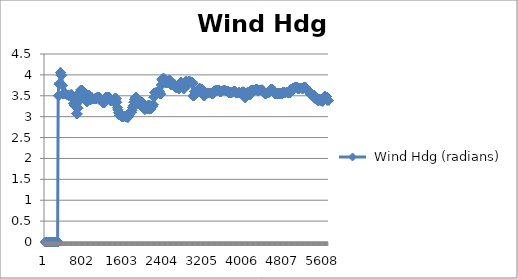
| Category |  Wind Hdg (radians) |
|---|---|
| 0 | 0 |
| 1 | 0 |
| 2 | 0 |
| 3 | 0 |
| 4 | 0 |
| 5 | 0 |
| 6 | 0 |
| 7 | 0 |
| 8 | 0 |
| 9 | 0 |
| 10 | 0 |
| 11 | 0 |
| 12 | 0 |
| 13 | 0 |
| 14 | 0 |
| 15 | 0 |
| 16 | 0 |
| 17 | 0 |
| 18 | 0 |
| 19 | 0 |
| 20 | 0 |
| 21 | 0 |
| 22 | 0 |
| 23 | 0 |
| 24 | 0 |
| 25 | 0 |
| 26 | 0 |
| 27 | 0 |
| 28 | 0 |
| 29 | 0 |
| 30 | 0 |
| 31 | 0 |
| 32 | 0 |
| 33 | 0 |
| 34 | 0 |
| 35 | 0 |
| 36 | 0 |
| 37 | 0 |
| 38 | 0 |
| 39 | 0 |
| 40 | 0 |
| 41 | 0 |
| 42 | 0 |
| 43 | 0 |
| 44 | 0 |
| 45 | 0 |
| 46 | 0 |
| 47 | 0 |
| 48 | 0 |
| 49 | 0 |
| 50 | 0 |
| 51 | 0 |
| 52 | 0 |
| 53 | 0 |
| 54 | 0 |
| 55 | 0 |
| 56 | 0 |
| 57 | 0 |
| 58 | 0 |
| 59 | 0 |
| 60 | 0 |
| 61 | 0 |
| 62 | 0 |
| 63 | 0 |
| 64 | 0 |
| 65 | 0 |
| 66 | 0 |
| 67 | 0 |
| 68 | 0 |
| 69 | 0 |
| 70 | 0 |
| 71 | 0 |
| 72 | 0 |
| 73 | 0 |
| 74 | 0 |
| 75 | 0 |
| 76 | 0 |
| 77 | 0 |
| 78 | 0 |
| 79 | 0 |
| 80 | 0 |
| 81 | 0 |
| 82 | 0 |
| 83 | 0 |
| 84 | 0 |
| 85 | 0 |
| 86 | 0 |
| 87 | 0 |
| 88 | 0 |
| 89 | 0 |
| 90 | 0 |
| 91 | 0 |
| 92 | 0 |
| 93 | 0 |
| 94 | 0 |
| 95 | 0 |
| 96 | 0 |
| 97 | 0 |
| 98 | 0 |
| 99 | 0 |
| 100 | 0 |
| 101 | 0 |
| 102 | 0 |
| 103 | 0 |
| 104 | 0 |
| 105 | 0 |
| 106 | 0 |
| 107 | 0 |
| 108 | 0 |
| 109 | 0 |
| 110 | 0 |
| 111 | 0 |
| 112 | 0 |
| 113 | 0 |
| 114 | 0 |
| 115 | 0 |
| 116 | 0 |
| 117 | 0 |
| 118 | 0 |
| 119 | 0 |
| 120 | 0 |
| 121 | 0 |
| 122 | 0 |
| 123 | 0 |
| 124 | 0 |
| 125 | 0 |
| 126 | 0 |
| 127 | 0 |
| 128 | 0 |
| 129 | 0 |
| 130 | 0 |
| 131 | 0 |
| 132 | 0 |
| 133 | 0 |
| 134 | 0 |
| 135 | 0 |
| 136 | 0 |
| 137 | 0 |
| 138 | 0 |
| 139 | 0 |
| 140 | 0 |
| 141 | 0 |
| 142 | 0 |
| 143 | 0 |
| 144 | 0 |
| 145 | 0 |
| 146 | 0 |
| 147 | 0 |
| 148 | 0 |
| 149 | 0 |
| 150 | 0 |
| 151 | 0 |
| 152 | 0 |
| 153 | 0 |
| 154 | 0 |
| 155 | 0 |
| 156 | 0 |
| 157 | 0 |
| 158 | 0 |
| 159 | 0 |
| 160 | 0 |
| 161 | 0 |
| 162 | 0 |
| 163 | 0 |
| 164 | 0 |
| 165 | 0 |
| 166 | 0 |
| 167 | 0 |
| 168 | 0 |
| 169 | 0 |
| 170 | 0 |
| 171 | 0 |
| 172 | 0 |
| 173 | 0 |
| 174 | 0 |
| 175 | 0 |
| 176 | 0 |
| 177 | 0 |
| 178 | 0 |
| 179 | 0 |
| 180 | 0 |
| 181 | 0 |
| 182 | 0 |
| 183 | 0 |
| 184 | 0 |
| 185 | 0 |
| 186 | 0 |
| 187 | 0 |
| 188 | 0 |
| 189 | 0 |
| 190 | 0 |
| 191 | 0 |
| 192 | 0 |
| 193 | 0 |
| 194 | 0 |
| 195 | 0 |
| 196 | 0 |
| 197 | 0 |
| 198 | 0 |
| 199 | 0 |
| 200 | 0 |
| 201 | 0 |
| 202 | 0 |
| 203 | 0 |
| 204 | 0 |
| 205 | 0 |
| 206 | 0 |
| 207 | 0 |
| 208 | 0 |
| 209 | 0 |
| 210 | 0 |
| 211 | 0 |
| 212 | 0 |
| 213 | 0 |
| 214 | 0 |
| 215 | 0 |
| 216 | 0 |
| 217 | 0 |
| 218 | 0 |
| 219 | 0 |
| 220 | 0 |
| 221 | 0 |
| 222 | 0 |
| 223 | 0 |
| 224 | 0 |
| 225 | 0 |
| 226 | 0 |
| 227 | 0 |
| 228 | 0 |
| 229 | 0 |
| 230 | 0 |
| 231 | 0 |
| 232 | 0 |
| 233 | 0 |
| 234 | 0 |
| 235 | 0 |
| 236 | 0 |
| 237 | 0 |
| 238 | 0 |
| 239 | 0 |
| 240 | 0 |
| 241 | 0 |
| 242 | 0 |
| 243 | 0 |
| 244 | 0 |
| 245 | 0 |
| 246 | 0 |
| 247 | 0 |
| 248 | 0 |
| 249 | 0 |
| 250 | 0 |
| 251 | 0 |
| 252 | 0 |
| 253 | 0 |
| 254 | 0 |
| 255 | 0 |
| 256 | 0 |
| 257 | 0 |
| 258 | 0 |
| 259 | 0 |
| 260 | 0 |
| 261 | 0 |
| 262 | 0 |
| 263 | 3.498 |
| 264 | 3.498 |
| 265 | 3.498 |
| 266 | 3.498 |
| 267 | 3.498 |
| 268 | 3.498 |
| 269 | 3.498 |
| 270 | 3.498 |
| 271 | 3.498 |
| 272 | 3.498 |
| 273 | 3.498 |
| 274 | 3.498 |
| 275 | 3.498 |
| 276 | 3.498 |
| 277 | 3.498 |
| 278 | 3.778 |
| 279 | 3.778 |
| 280 | 3.778 |
| 281 | 3.778 |
| 282 | 3.778 |
| 283 | 3.778 |
| 284 | 3.778 |
| 285 | 3.778 |
| 286 | 3.778 |
| 287 | 3.778 |
| 288 | 3.778 |
| 289 | 3.778 |
| 290 | 3.808 |
| 291 | 3.808 |
| 292 | 3.808 |
| 293 | 3.808 |
| 294 | 3.808 |
| 295 | 3.808 |
| 296 | 3.808 |
| 297 | 3.808 |
| 298 | 3.808 |
| 299 | 3.808 |
| 300 | 3.808 |
| 301 | 3.808 |
| 302 | 4.059 |
| 303 | 4.059 |
| 304 | 4.059 |
| 305 | 4.059 |
| 306 | 4.059 |
| 307 | 4.059 |
| 308 | 4.059 |
| 309 | 4.059 |
| 310 | 4.059 |
| 311 | 4.059 |
| 312 | 4.059 |
| 313 | 4.059 |
| 314 | 4.059 |
| 315 | 4.059 |
| 316 | 3.992 |
| 317 | 3.992 |
| 318 | 3.992 |
| 319 | 3.992 |
| 320 | 3.992 |
| 321 | 3.992 |
| 322 | 3.992 |
| 323 | 3.992 |
| 324 | 3.992 |
| 325 | 3.992 |
| 326 | 3.992 |
| 327 | 3.992 |
| 328 | 3.992 |
| 329 | 3.988 |
| 330 | 3.988 |
| 331 | 3.988 |
| 332 | 3.988 |
| 333 | 3.988 |
| 334 | 3.988 |
| 335 | 3.988 |
| 336 | 3.988 |
| 337 | 3.988 |
| 338 | 3.988 |
| 339 | 3.988 |
| 340 | 3.988 |
| 341 | 3.988 |
| 342 | 3.988 |
| 343 | 3.754 |
| 344 | 3.754 |
| 345 | 3.754 |
| 346 | 3.754 |
| 347 | 3.754 |
| 348 | 3.754 |
| 349 | 3.754 |
| 350 | 3.754 |
| 351 | 3.754 |
| 352 | 3.754 |
| 353 | 3.754 |
| 354 | 3.754 |
| 355 | 3.754 |
| 356 | 3.533 |
| 357 | 3.533 |
| 358 | 3.533 |
| 359 | 3.533 |
| 360 | 3.533 |
| 361 | 3.533 |
| 362 | 3.533 |
| 363 | 3.533 |
| 364 | 3.533 |
| 365 | 3.533 |
| 366 | 3.533 |
| 367 | 3.533 |
| 368 | 3.533 |
| 369 | 3.551 |
| 370 | 3.551 |
| 371 | 3.551 |
| 372 | 3.551 |
| 373 | 3.551 |
| 374 | 3.551 |
| 375 | 3.551 |
| 376 | 3.551 |
| 377 | 3.551 |
| 378 | 3.551 |
| 379 | 3.551 |
| 380 | 3.551 |
| 381 | 3.551 |
| 382 | 3.551 |
| 383 | 3.551 |
| 384 | 3.551 |
| 385 | 3.574 |
| 386 | 3.574 |
| 387 | 3.574 |
| 388 | 3.574 |
| 389 | 3.574 |
| 390 | 3.574 |
| 391 | 3.574 |
| 392 | 3.574 |
| 393 | 3.574 |
| 394 | 3.574 |
| 395 | 3.574 |
| 396 | 3.574 |
| 397 | 3.569 |
| 398 | 3.569 |
| 399 | 3.569 |
| 400 | 3.569 |
| 401 | 3.569 |
| 402 | 3.569 |
| 403 | 3.569 |
| 404 | 3.569 |
| 405 | 3.569 |
| 406 | 3.569 |
| 407 | 3.569 |
| 408 | 3.569 |
| 409 | 3.569 |
| 410 | 3.569 |
| 411 | 3.54 |
| 412 | 3.54 |
| 413 | 3.54 |
| 414 | 3.54 |
| 415 | 3.54 |
| 416 | 3.54 |
| 417 | 3.54 |
| 418 | 3.54 |
| 419 | 3.54 |
| 420 | 3.54 |
| 421 | 3.54 |
| 422 | 3.54 |
| 423 | 3.54 |
| 424 | 3.53 |
| 425 | 3.53 |
| 426 | 3.53 |
| 427 | 3.53 |
| 428 | 3.53 |
| 429 | 3.53 |
| 430 | 3.53 |
| 431 | 3.53 |
| 432 | 3.53 |
| 433 | 3.53 |
| 434 | 3.53 |
| 435 | 3.53 |
| 436 | 3.53 |
| 437 | 3.53 |
| 438 | 3.53 |
| 439 | 3.526 |
| 440 | 3.526 |
| 441 | 3.526 |
| 442 | 3.526 |
| 443 | 3.526 |
| 444 | 3.526 |
| 445 | 3.526 |
| 446 | 3.526 |
| 447 | 3.526 |
| 448 | 3.526 |
| 449 | 3.526 |
| 450 | 3.526 |
| 451 | 3.526 |
| 452 | 3.526 |
| 453 | 3.517 |
| 454 | 3.517 |
| 455 | 3.517 |
| 456 | 3.517 |
| 457 | 3.517 |
| 458 | 3.517 |
| 459 | 3.517 |
| 460 | 3.517 |
| 461 | 3.517 |
| 462 | 3.517 |
| 463 | 3.517 |
| 464 | 3.517 |
| 465 | 3.517 |
| 466 | 3.509 |
| 467 | 3.509 |
| 468 | 3.509 |
| 469 | 3.509 |
| 470 | 3.509 |
| 471 | 3.509 |
| 472 | 3.509 |
| 473 | 3.509 |
| 474 | 3.509 |
| 475 | 3.509 |
| 476 | 3.509 |
| 477 | 3.509 |
| 478 | 3.509 |
| 479 | 3.509 |
| 480 | 3.49 |
| 481 | 3.49 |
| 482 | 3.49 |
| 483 | 3.49 |
| 484 | 3.49 |
| 485 | 3.49 |
| 486 | 3.49 |
| 487 | 3.49 |
| 488 | 3.49 |
| 489 | 3.49 |
| 490 | 3.49 |
| 491 | 3.49 |
| 492 | 3.49 |
| 493 | 3.498 |
| 494 | 3.498 |
| 495 | 3.498 |
| 496 | 3.498 |
| 497 | 3.498 |
| 498 | 3.498 |
| 499 | 3.498 |
| 500 | 3.498 |
| 501 | 3.498 |
| 502 | 3.498 |
| 503 | 3.498 |
| 504 | 3.498 |
| 505 | 3.518 |
| 506 | 3.518 |
| 507 | 3.518 |
| 508 | 3.518 |
| 509 | 3.518 |
| 510 | 3.518 |
| 511 | 3.518 |
| 512 | 3.518 |
| 513 | 3.518 |
| 514 | 3.518 |
| 515 | 3.518 |
| 516 | 3.518 |
| 517 | 3.518 |
| 518 | 3.518 |
| 519 | 3.518 |
| 520 | 3.518 |
| 521 | 3.533 |
| 522 | 3.533 |
| 523 | 3.533 |
| 524 | 3.533 |
| 525 | 3.533 |
| 526 | 3.533 |
| 527 | 3.533 |
| 528 | 3.533 |
| 529 | 3.533 |
| 530 | 3.533 |
| 531 | 3.533 |
| 532 | 3.533 |
| 533 | 3.533 |
| 534 | 3.521 |
| 535 | 3.521 |
| 536 | 3.521 |
| 537 | 3.521 |
| 538 | 3.521 |
| 539 | 3.521 |
| 540 | 3.521 |
| 541 | 3.521 |
| 542 | 3.521 |
| 543 | 3.521 |
| 544 | 3.521 |
| 545 | 3.521 |
| 546 | 3.521 |
| 547 | 3.453 |
| 548 | 3.453 |
| 549 | 3.453 |
| 550 | 3.453 |
| 551 | 3.453 |
| 552 | 3.453 |
| 553 | 3.453 |
| 554 | 3.453 |
| 555 | 3.453 |
| 556 | 3.453 |
| 557 | 3.453 |
| 558 | 3.453 |
| 559 | 3.453 |
| 560 | 3.315 |
| 561 | 3.315 |
| 562 | 3.315 |
| 563 | 3.315 |
| 564 | 3.315 |
| 565 | 3.315 |
| 566 | 3.315 |
| 567 | 3.315 |
| 568 | 3.315 |
| 569 | 3.315 |
| 570 | 3.315 |
| 571 | 3.315 |
| 572 | 3.315 |
| 573 | 3.315 |
| 574 | 3.279 |
| 575 | 3.279 |
| 576 | 3.279 |
| 577 | 3.279 |
| 578 | 3.279 |
| 579 | 3.279 |
| 580 | 3.279 |
| 581 | 3.279 |
| 582 | 3.279 |
| 583 | 3.279 |
| 584 | 3.279 |
| 585 | 3.279 |
| 586 | 3.299 |
| 587 | 3.299 |
| 588 | 3.299 |
| 589 | 3.299 |
| 590 | 3.299 |
| 591 | 3.299 |
| 592 | 3.299 |
| 593 | 3.299 |
| 594 | 3.299 |
| 595 | 3.299 |
| 596 | 3.299 |
| 597 | 3.299 |
| 598 | 3.299 |
| 599 | 3.299 |
| 600 | 3.324 |
| 601 | 3.324 |
| 602 | 3.324 |
| 603 | 3.324 |
| 604 | 3.324 |
| 605 | 3.324 |
| 606 | 3.324 |
| 607 | 3.324 |
| 608 | 3.324 |
| 609 | 3.324 |
| 610 | 3.324 |
| 611 | 3.324 |
| 612 | 3.324 |
| 613 | 3.291 |
| 614 | 3.291 |
| 615 | 3.291 |
| 616 | 3.291 |
| 617 | 3.291 |
| 618 | 3.291 |
| 619 | 3.291 |
| 620 | 3.291 |
| 621 | 3.291 |
| 622 | 3.291 |
| 623 | 3.291 |
| 624 | 3.291 |
| 625 | 3.291 |
| 626 | 3.069 |
| 627 | 3.069 |
| 628 | 3.069 |
| 629 | 3.069 |
| 630 | 3.069 |
| 631 | 3.069 |
| 632 | 3.069 |
| 633 | 3.069 |
| 634 | 3.069 |
| 635 | 3.069 |
| 636 | 3.069 |
| 637 | 3.069 |
| 638 | 3.069 |
| 639 | 3.069 |
| 640 | 3.069 |
| 641 | 3.064 |
| 642 | 3.064 |
| 643 | 3.064 |
| 644 | 3.064 |
| 645 | 3.064 |
| 646 | 3.064 |
| 647 | 3.064 |
| 648 | 3.064 |
| 649 | 3.064 |
| 650 | 3.064 |
| 651 | 3.064 |
| 652 | 3.064 |
| 653 | 3.064 |
| 654 | 3.205 |
| 655 | 3.205 |
| 656 | 3.205 |
| 657 | 3.205 |
| 658 | 3.205 |
| 659 | 3.205 |
| 660 | 3.205 |
| 661 | 3.205 |
| 662 | 3.205 |
| 663 | 3.205 |
| 664 | 3.205 |
| 665 | 3.205 |
| 666 | 3.366 |
| 667 | 3.366 |
| 668 | 3.366 |
| 669 | 3.366 |
| 670 | 3.366 |
| 671 | 3.366 |
| 672 | 3.366 |
| 673 | 3.366 |
| 674 | 3.366 |
| 675 | 3.366 |
| 676 | 3.366 |
| 677 | 3.366 |
| 678 | 3.366 |
| 679 | 3.366 |
| 680 | 3.366 |
| 681 | 3.494 |
| 682 | 3.494 |
| 683 | 3.494 |
| 684 | 3.494 |
| 685 | 3.494 |
| 686 | 3.494 |
| 687 | 3.494 |
| 688 | 3.494 |
| 689 | 3.494 |
| 690 | 3.494 |
| 691 | 3.494 |
| 692 | 3.494 |
| 693 | 3.494 |
| 694 | 3.584 |
| 695 | 3.584 |
| 696 | 3.584 |
| 697 | 3.584 |
| 698 | 3.584 |
| 699 | 3.584 |
| 700 | 3.584 |
| 701 | 3.584 |
| 702 | 3.584 |
| 703 | 3.584 |
| 704 | 3.584 |
| 705 | 3.584 |
| 706 | 3.584 |
| 707 | 3.639 |
| 708 | 3.639 |
| 709 | 3.639 |
| 710 | 3.639 |
| 711 | 3.639 |
| 712 | 3.639 |
| 713 | 3.639 |
| 714 | 3.639 |
| 715 | 3.639 |
| 716 | 3.639 |
| 717 | 3.639 |
| 718 | 3.639 |
| 719 | 3.639 |
| 720 | 3.639 |
| 721 | 3.634 |
| 722 | 3.634 |
| 723 | 3.634 |
| 724 | 3.634 |
| 725 | 3.634 |
| 726 | 3.634 |
| 727 | 3.634 |
| 728 | 3.634 |
| 729 | 3.634 |
| 730 | 3.634 |
| 731 | 3.634 |
| 732 | 3.634 |
| 733 | 3.632 |
| 734 | 3.632 |
| 735 | 3.632 |
| 736 | 3.632 |
| 737 | 3.632 |
| 738 | 3.632 |
| 739 | 3.632 |
| 740 | 3.632 |
| 741 | 3.632 |
| 742 | 3.632 |
| 743 | 3.632 |
| 744 | 3.632 |
| 745 | 3.632 |
| 746 | 3.632 |
| 747 | 3.632 |
| 748 | 3.62 |
| 749 | 3.62 |
| 750 | 3.62 |
| 751 | 3.62 |
| 752 | 3.62 |
| 753 | 3.62 |
| 754 | 3.62 |
| 755 | 3.62 |
| 756 | 3.62 |
| 757 | 3.62 |
| 758 | 3.62 |
| 759 | 3.62 |
| 760 | 3.62 |
| 761 | 3.62 |
| 762 | 3.62 |
| 763 | 3.596 |
| 764 | 3.596 |
| 765 | 3.596 |
| 766 | 3.596 |
| 767 | 3.596 |
| 768 | 3.596 |
| 769 | 3.596 |
| 770 | 3.596 |
| 771 | 3.596 |
| 772 | 3.596 |
| 773 | 3.596 |
| 774 | 3.596 |
| 775 | 3.596 |
| 776 | 3.552 |
| 777 | 3.552 |
| 778 | 3.552 |
| 779 | 3.552 |
| 780 | 3.552 |
| 781 | 3.552 |
| 782 | 3.552 |
| 783 | 3.552 |
| 784 | 3.552 |
| 785 | 3.552 |
| 786 | 3.552 |
| 787 | 3.552 |
| 788 | 3.552 |
| 789 | 3.552 |
| 790 | 3.552 |
| 791 | 3.552 |
| 792 | 3.516 |
| 793 | 3.516 |
| 794 | 3.516 |
| 795 | 3.516 |
| 796 | 3.516 |
| 797 | 3.516 |
| 798 | 3.516 |
| 799 | 3.516 |
| 800 | 3.516 |
| 801 | 3.516 |
| 802 | 3.516 |
| 803 | 3.516 |
| 804 | 3.516 |
| 805 | 3.474 |
| 806 | 3.474 |
| 807 | 3.474 |
| 808 | 3.474 |
| 809 | 3.474 |
| 810 | 3.474 |
| 811 | 3.474 |
| 812 | 3.474 |
| 813 | 3.474 |
| 814 | 3.474 |
| 815 | 3.474 |
| 816 | 3.474 |
| 817 | 3.37 |
| 818 | 3.37 |
| 819 | 3.37 |
| 820 | 3.37 |
| 821 | 3.37 |
| 822 | 3.37 |
| 823 | 3.37 |
| 824 | 3.37 |
| 825 | 3.37 |
| 826 | 3.37 |
| 827 | 3.37 |
| 828 | 3.37 |
| 829 | 3.37 |
| 830 | 3.37 |
| 831 | 3.37 |
| 832 | 3.349 |
| 833 | 3.349 |
| 834 | 3.349 |
| 835 | 3.349 |
| 836 | 3.349 |
| 837 | 3.349 |
| 838 | 3.349 |
| 839 | 3.349 |
| 840 | 3.349 |
| 841 | 3.349 |
| 842 | 3.349 |
| 843 | 3.349 |
| 844 | 3.349 |
| 845 | 3.391 |
| 846 | 3.391 |
| 847 | 3.391 |
| 848 | 3.391 |
| 849 | 3.391 |
| 850 | 3.391 |
| 851 | 3.391 |
| 852 | 3.391 |
| 853 | 3.391 |
| 854 | 3.391 |
| 855 | 3.391 |
| 856 | 3.468 |
| 857 | 3.468 |
| 858 | 3.468 |
| 859 | 3.468 |
| 860 | 3.468 |
| 861 | 3.468 |
| 862 | 3.468 |
| 863 | 3.468 |
| 864 | 3.468 |
| 865 | 3.468 |
| 866 | 3.468 |
| 867 | 3.468 |
| 868 | 3.468 |
| 869 | 3.468 |
| 870 | 3.468 |
| 871 | 3.468 |
| 872 | 3.514 |
| 873 | 3.514 |
| 874 | 3.514 |
| 875 | 3.514 |
| 876 | 3.514 |
| 877 | 3.514 |
| 878 | 3.514 |
| 879 | 3.514 |
| 880 | 3.514 |
| 881 | 3.514 |
| 882 | 3.514 |
| 883 | 3.434 |
| 884 | 3.434 |
| 885 | 3.434 |
| 886 | 3.434 |
| 887 | 3.434 |
| 888 | 3.434 |
| 889 | 3.434 |
| 890 | 3.434 |
| 891 | 3.434 |
| 892 | 3.434 |
| 893 | 3.434 |
| 894 | 3.434 |
| 895 | 3.434 |
| 896 | 3.434 |
| 897 | 3.391 |
| 898 | 3.391 |
| 899 | 3.391 |
| 900 | 3.391 |
| 901 | 3.391 |
| 902 | 3.391 |
| 903 | 3.391 |
| 904 | 3.391 |
| 905 | 3.391 |
| 906 | 3.391 |
| 907 | 3.391 |
| 908 | 3.391 |
| 909 | 3.459 |
| 910 | 3.459 |
| 911 | 3.459 |
| 912 | 3.459 |
| 913 | 3.459 |
| 914 | 3.459 |
| 915 | 3.459 |
| 916 | 3.459 |
| 917 | 3.459 |
| 918 | 3.459 |
| 919 | 3.459 |
| 920 | 3.459 |
| 921 | 3.459 |
| 922 | 3.459 |
| 923 | 3.463 |
| 924 | 3.463 |
| 925 | 3.463 |
| 926 | 3.463 |
| 927 | 3.463 |
| 928 | 3.463 |
| 929 | 3.463 |
| 930 | 3.463 |
| 931 | 3.463 |
| 932 | 3.463 |
| 933 | 3.463 |
| 934 | 3.463 |
| 935 | 3.463 |
| 936 | 3.463 |
| 937 | 3.463 |
| 938 | 3.452 |
| 939 | 3.452 |
| 940 | 3.452 |
| 941 | 3.452 |
| 942 | 3.452 |
| 943 | 3.452 |
| 944 | 3.452 |
| 945 | 3.452 |
| 946 | 3.452 |
| 947 | 3.452 |
| 948 | 3.452 |
| 949 | 3.452 |
| 950 | 3.425 |
| 951 | 3.425 |
| 952 | 3.425 |
| 953 | 3.425 |
| 954 | 3.425 |
| 955 | 3.425 |
| 956 | 3.425 |
| 957 | 3.425 |
| 958 | 3.425 |
| 959 | 3.425 |
| 960 | 3.425 |
| 961 | 3.425 |
| 962 | 3.425 |
| 963 | 3.425 |
| 964 | 3.411 |
| 965 | 3.411 |
| 966 | 3.411 |
| 967 | 3.411 |
| 968 | 3.411 |
| 969 | 3.411 |
| 970 | 3.411 |
| 971 | 3.411 |
| 972 | 3.411 |
| 973 | 3.411 |
| 974 | 3.411 |
| 975 | 3.411 |
| 976 | 3.411 |
| 977 | 3.411 |
| 978 | 3.413 |
| 979 | 3.413 |
| 980 | 3.413 |
| 981 | 3.413 |
| 982 | 3.413 |
| 983 | 3.413 |
| 984 | 3.413 |
| 985 | 3.413 |
| 986 | 3.413 |
| 987 | 3.413 |
| 988 | 3.413 |
| 989 | 3.413 |
| 990 | 3.422 |
| 991 | 3.422 |
| 992 | 3.422 |
| 993 | 3.422 |
| 994 | 3.422 |
| 995 | 3.422 |
| 996 | 3.422 |
| 997 | 3.422 |
| 998 | 3.422 |
| 999 | 3.422 |
| 1000 | 3.422 |
| 1001 | 3.422 |
| 1002 | 3.422 |
| 1003 | 3.422 |
| 1004 | 3.443 |
| 1005 | 3.443 |
| 1006 | 3.443 |
| 1007 | 3.443 |
| 1008 | 3.443 |
| 1009 | 3.443 |
| 1010 | 3.443 |
| 1011 | 3.443 |
| 1012 | 3.443 |
| 1013 | 3.443 |
| 1014 | 3.443 |
| 1015 | 3.443 |
| 1016 | 3.431 |
| 1017 | 3.431 |
| 1018 | 3.431 |
| 1019 | 3.431 |
| 1020 | 3.431 |
| 1021 | 3.431 |
| 1022 | 3.431 |
| 1023 | 3.431 |
| 1024 | 3.431 |
| 1025 | 3.431 |
| 1026 | 3.431 |
| 1027 | 3.431 |
| 1028 | 3.431 |
| 1029 | 3.431 |
| 1030 | 3.431 |
| 1031 | 3.431 |
| 1032 | 3.456 |
| 1033 | 3.456 |
| 1034 | 3.456 |
| 1035 | 3.456 |
| 1036 | 3.456 |
| 1037 | 3.456 |
| 1038 | 3.456 |
| 1039 | 3.456 |
| 1040 | 3.456 |
| 1041 | 3.456 |
| 1042 | 3.456 |
| 1043 | 3.456 |
| 1044 | 3.472 |
| 1045 | 3.472 |
| 1046 | 3.472 |
| 1047 | 3.472 |
| 1048 | 3.472 |
| 1049 | 3.472 |
| 1050 | 3.472 |
| 1051 | 3.472 |
| 1052 | 3.472 |
| 1053 | 3.472 |
| 1054 | 3.472 |
| 1055 | 3.472 |
| 1056 | 3.472 |
| 1057 | 3.472 |
| 1058 | 3.475 |
| 1059 | 3.475 |
| 1060 | 3.475 |
| 1061 | 3.475 |
| 1062 | 3.475 |
| 1063 | 3.475 |
| 1064 | 3.475 |
| 1065 | 3.475 |
| 1066 | 3.475 |
| 1067 | 3.475 |
| 1068 | 3.475 |
| 1069 | 3.475 |
| 1070 | 3.475 |
| 1071 | 3.475 |
| 1072 | 3.475 |
| 1073 | 3.463 |
| 1074 | 3.463 |
| 1075 | 3.463 |
| 1076 | 3.463 |
| 1077 | 3.463 |
| 1078 | 3.463 |
| 1079 | 3.463 |
| 1080 | 3.463 |
| 1081 | 3.463 |
| 1082 | 3.463 |
| 1083 | 3.463 |
| 1084 | 3.463 |
| 1085 | 3.463 |
| 1086 | 3.403 |
| 1087 | 3.403 |
| 1088 | 3.403 |
| 1089 | 3.403 |
| 1090 | 3.403 |
| 1091 | 3.403 |
| 1092 | 3.403 |
| 1093 | 3.403 |
| 1094 | 3.403 |
| 1095 | 3.403 |
| 1096 | 3.403 |
| 1097 | 3.403 |
| 1098 | 3.403 |
| 1099 | 3.437 |
| 1100 | 3.437 |
| 1101 | 3.437 |
| 1102 | 3.437 |
| 1103 | 3.437 |
| 1104 | 3.437 |
| 1105 | 3.437 |
| 1106 | 3.437 |
| 1107 | 3.437 |
| 1108 | 3.437 |
| 1109 | 3.437 |
| 1110 | 3.437 |
| 1111 | 3.437 |
| 1112 | 3.437 |
| 1113 | 3.406 |
| 1114 | 3.406 |
| 1115 | 3.406 |
| 1116 | 3.406 |
| 1117 | 3.406 |
| 1118 | 3.406 |
| 1119 | 3.406 |
| 1120 | 3.406 |
| 1121 | 3.406 |
| 1122 | 3.406 |
| 1123 | 3.406 |
| 1124 | 3.406 |
| 1125 | 3.39 |
| 1126 | 3.39 |
| 1127 | 3.39 |
| 1128 | 3.39 |
| 1129 | 3.39 |
| 1130 | 3.39 |
| 1131 | 3.39 |
| 1132 | 3.39 |
| 1133 | 3.39 |
| 1134 | 3.39 |
| 1135 | 3.39 |
| 1136 | 3.39 |
| 1137 | 3.39 |
| 1138 | 3.39 |
| 1139 | 3.39 |
| 1140 | 3.39 |
| 1141 | 3.345 |
| 1142 | 3.345 |
| 1143 | 3.345 |
| 1144 | 3.345 |
| 1145 | 3.345 |
| 1146 | 3.345 |
| 1147 | 3.345 |
| 1148 | 3.345 |
| 1149 | 3.345 |
| 1150 | 3.345 |
| 1151 | 3.345 |
| 1152 | 3.345 |
| 1153 | 3.345 |
| 1154 | 3.323 |
| 1155 | 3.323 |
| 1156 | 3.323 |
| 1157 | 3.323 |
| 1158 | 3.323 |
| 1159 | 3.323 |
| 1160 | 3.323 |
| 1161 | 3.323 |
| 1162 | 3.323 |
| 1163 | 3.323 |
| 1164 | 3.323 |
| 1165 | 3.323 |
| 1166 | 3.323 |
| 1167 | 3.323 |
| 1168 | 3.323 |
| 1169 | 3.327 |
| 1170 | 3.327 |
| 1171 | 3.327 |
| 1172 | 3.327 |
| 1173 | 3.327 |
| 1174 | 3.327 |
| 1175 | 3.327 |
| 1176 | 3.327 |
| 1177 | 3.327 |
| 1178 | 3.327 |
| 1179 | 3.327 |
| 1180 | 3.327 |
| 1181 | 3.33 |
| 1182 | 3.33 |
| 1183 | 3.33 |
| 1184 | 3.33 |
| 1185 | 3.33 |
| 1186 | 3.33 |
| 1187 | 3.33 |
| 1188 | 3.33 |
| 1189 | 3.33 |
| 1190 | 3.33 |
| 1191 | 3.33 |
| 1192 | 3.33 |
| 1193 | 3.33 |
| 1194 | 3.35 |
| 1195 | 3.35 |
| 1196 | 3.35 |
| 1197 | 3.35 |
| 1198 | 3.35 |
| 1199 | 3.35 |
| 1200 | 3.35 |
| 1201 | 3.35 |
| 1202 | 3.35 |
| 1203 | 3.35 |
| 1204 | 3.35 |
| 1205 | 3.35 |
| 1206 | 3.35 |
| 1207 | 3.35 |
| 1208 | 3.435 |
| 1209 | 3.435 |
| 1210 | 3.435 |
| 1211 | 3.435 |
| 1212 | 3.435 |
| 1213 | 3.435 |
| 1214 | 3.435 |
| 1215 | 3.435 |
| 1216 | 3.435 |
| 1217 | 3.435 |
| 1218 | 3.435 |
| 1219 | 3.435 |
| 1220 | 3.435 |
| 1221 | 3.435 |
| 1222 | 3.476 |
| 1223 | 3.476 |
| 1224 | 3.476 |
| 1225 | 3.476 |
| 1226 | 3.476 |
| 1227 | 3.476 |
| 1228 | 3.476 |
| 1229 | 3.476 |
| 1230 | 3.476 |
| 1231 | 3.476 |
| 1232 | 3.476 |
| 1233 | 3.476 |
| 1234 | 3.476 |
| 1235 | 3.476 |
| 1236 | 3.481 |
| 1237 | 3.481 |
| 1238 | 3.481 |
| 1239 | 3.481 |
| 1240 | 3.481 |
| 1241 | 3.481 |
| 1242 | 3.481 |
| 1243 | 3.481 |
| 1244 | 3.481 |
| 1245 | 3.481 |
| 1246 | 3.481 |
| 1247 | 3.481 |
| 1248 | 3.481 |
| 1249 | 3.481 |
| 1250 | 3.479 |
| 1251 | 3.479 |
| 1252 | 3.479 |
| 1253 | 3.479 |
| 1254 | 3.479 |
| 1255 | 3.479 |
| 1256 | 3.479 |
| 1257 | 3.479 |
| 1258 | 3.479 |
| 1259 | 3.479 |
| 1260 | 3.479 |
| 1261 | 3.479 |
| 1262 | 3.479 |
| 1263 | 3.479 |
| 1264 | 3.479 |
| 1265 | 3.467 |
| 1266 | 3.467 |
| 1267 | 3.467 |
| 1268 | 3.467 |
| 1269 | 3.467 |
| 1270 | 3.467 |
| 1271 | 3.467 |
| 1272 | 3.467 |
| 1273 | 3.467 |
| 1274 | 3.467 |
| 1275 | 3.467 |
| 1276 | 3.467 |
| 1277 | 3.466 |
| 1278 | 3.466 |
| 1279 | 3.466 |
| 1280 | 3.466 |
| 1281 | 3.466 |
| 1282 | 3.466 |
| 1283 | 3.466 |
| 1284 | 3.466 |
| 1285 | 3.466 |
| 1286 | 3.466 |
| 1287 | 3.466 |
| 1288 | 3.466 |
| 1289 | 3.466 |
| 1290 | 3.466 |
| 1291 | 3.401 |
| 1292 | 3.401 |
| 1293 | 3.401 |
| 1294 | 3.401 |
| 1295 | 3.401 |
| 1296 | 3.401 |
| 1297 | 3.401 |
| 1298 | 3.401 |
| 1299 | 3.401 |
| 1300 | 3.401 |
| 1301 | 3.401 |
| 1302 | 3.401 |
| 1303 | 3.401 |
| 1304 | 3.401 |
| 1305 | 3.375 |
| 1306 | 3.375 |
| 1307 | 3.375 |
| 1308 | 3.375 |
| 1309 | 3.375 |
| 1310 | 3.375 |
| 1311 | 3.375 |
| 1312 | 3.375 |
| 1313 | 3.375 |
| 1314 | 3.375 |
| 1315 | 3.375 |
| 1316 | 3.375 |
| 1317 | 3.38 |
| 1318 | 3.38 |
| 1319 | 3.38 |
| 1320 | 3.38 |
| 1321 | 3.38 |
| 1322 | 3.38 |
| 1323 | 3.38 |
| 1324 | 3.38 |
| 1325 | 3.38 |
| 1326 | 3.38 |
| 1327 | 3.38 |
| 1328 | 3.38 |
| 1329 | 3.38 |
| 1330 | 3.38 |
| 1331 | 3.391 |
| 1332 | 3.391 |
| 1333 | 3.391 |
| 1334 | 3.391 |
| 1335 | 3.391 |
| 1336 | 3.391 |
| 1337 | 3.391 |
| 1338 | 3.391 |
| 1339 | 3.391 |
| 1340 | 3.391 |
| 1341 | 3.391 |
| 1342 | 3.391 |
| 1343 | 3.391 |
| 1344 | 3.391 |
| 1345 | 3.389 |
| 1346 | 3.389 |
| 1347 | 3.389 |
| 1348 | 3.389 |
| 1349 | 3.389 |
| 1350 | 3.389 |
| 1351 | 3.389 |
| 1352 | 3.389 |
| 1353 | 3.389 |
| 1354 | 3.389 |
| 1355 | 3.389 |
| 1356 | 3.389 |
| 1357 | 3.379 |
| 1358 | 3.379 |
| 1359 | 3.379 |
| 1360 | 3.379 |
| 1361 | 3.379 |
| 1362 | 3.379 |
| 1363 | 3.379 |
| 1364 | 3.379 |
| 1365 | 3.379 |
| 1366 | 3.379 |
| 1367 | 3.379 |
| 1368 | 3.379 |
| 1369 | 3.379 |
| 1370 | 3.379 |
| 1371 | 3.37 |
| 1372 | 3.37 |
| 1373 | 3.37 |
| 1374 | 3.37 |
| 1375 | 3.37 |
| 1376 | 3.37 |
| 1377 | 3.37 |
| 1378 | 3.37 |
| 1379 | 3.37 |
| 1380 | 3.37 |
| 1381 | 3.37 |
| 1382 | 3.37 |
| 1383 | 3.37 |
| 1384 | 3.37 |
| 1385 | 3.397 |
| 1386 | 3.397 |
| 1387 | 3.397 |
| 1388 | 3.397 |
| 1389 | 3.397 |
| 1390 | 3.397 |
| 1391 | 3.397 |
| 1392 | 3.397 |
| 1393 | 3.397 |
| 1394 | 3.397 |
| 1395 | 3.397 |
| 1396 | 3.397 |
| 1397 | 3.397 |
| 1398 | 3.397 |
| 1399 | 3.397 |
| 1400 | 3.397 |
| 1401 | 3.451 |
| 1402 | 3.451 |
| 1403 | 3.451 |
| 1404 | 3.451 |
| 1405 | 3.451 |
| 1406 | 3.451 |
| 1407 | 3.451 |
| 1408 | 3.451 |
| 1409 | 3.451 |
| 1410 | 3.451 |
| 1411 | 3.451 |
| 1412 | 3.451 |
| 1413 | 3.451 |
| 1414 | 3.43 |
| 1415 | 3.43 |
| 1416 | 3.43 |
| 1417 | 3.43 |
| 1418 | 3.43 |
| 1419 | 3.43 |
| 1420 | 3.43 |
| 1421 | 3.43 |
| 1422 | 3.43 |
| 1423 | 3.43 |
| 1424 | 3.43 |
| 1425 | 3.43 |
| 1426 | 3.43 |
| 1427 | 3.43 |
| 1428 | 3.43 |
| 1429 | 3.346 |
| 1430 | 3.346 |
| 1431 | 3.346 |
| 1432 | 3.346 |
| 1433 | 3.346 |
| 1434 | 3.346 |
| 1435 | 3.346 |
| 1436 | 3.346 |
| 1437 | 3.346 |
| 1438 | 3.346 |
| 1439 | 3.346 |
| 1440 | 3.218 |
| 1441 | 3.218 |
| 1442 | 3.218 |
| 1443 | 3.218 |
| 1444 | 3.218 |
| 1445 | 3.218 |
| 1446 | 3.218 |
| 1447 | 3.218 |
| 1448 | 3.218 |
| 1449 | 3.218 |
| 1450 | 3.218 |
| 1451 | 3.218 |
| 1452 | 3.164 |
| 1453 | 3.164 |
| 1454 | 3.164 |
| 1455 | 3.164 |
| 1456 | 3.164 |
| 1457 | 3.164 |
| 1458 | 3.164 |
| 1459 | 3.164 |
| 1460 | 3.164 |
| 1461 | 3.164 |
| 1462 | 3.164 |
| 1463 | 3.164 |
| 1464 | 3.164 |
| 1465 | 3.164 |
| 1466 | 3.091 |
| 1467 | 3.091 |
| 1468 | 3.091 |
| 1469 | 3.091 |
| 1470 | 3.091 |
| 1471 | 3.091 |
| 1472 | 3.091 |
| 1473 | 3.091 |
| 1474 | 3.091 |
| 1475 | 3.091 |
| 1476 | 3.091 |
| 1477 | 3.091 |
| 1478 | 3.091 |
| 1479 | 3.091 |
| 1480 | 3.091 |
| 1481 | 3.091 |
| 1482 | 3.031 |
| 1483 | 3.031 |
| 1484 | 3.031 |
| 1485 | 3.031 |
| 1486 | 3.031 |
| 1487 | 3.031 |
| 1488 | 3.031 |
| 1489 | 3.031 |
| 1490 | 3.031 |
| 1491 | 3.031 |
| 1492 | 3.031 |
| 1493 | 3.031 |
| 1494 | 3.031 |
| 1495 | 3.043 |
| 1496 | 3.043 |
| 1497 | 3.043 |
| 1498 | 3.043 |
| 1499 | 3.043 |
| 1500 | 3.043 |
| 1501 | 3.043 |
| 1502 | 3.043 |
| 1503 | 3.043 |
| 1504 | 3.043 |
| 1505 | 3.043 |
| 1506 | 3.043 |
| 1507 | 3.053 |
| 1508 | 3.053 |
| 1509 | 3.053 |
| 1510 | 3.053 |
| 1511 | 3.053 |
| 1512 | 3.053 |
| 1513 | 3.053 |
| 1514 | 3.053 |
| 1515 | 3.053 |
| 1516 | 3.053 |
| 1517 | 3.053 |
| 1518 | 3.053 |
| 1519 | 3.053 |
| 1520 | 3.02 |
| 1521 | 3.02 |
| 1522 | 3.02 |
| 1523 | 3.02 |
| 1524 | 3.02 |
| 1525 | 3.02 |
| 1526 | 3.02 |
| 1527 | 3.02 |
| 1528 | 3.02 |
| 1529 | 3.02 |
| 1530 | 3.02 |
| 1531 | 3.02 |
| 1532 | 3.02 |
| 1533 | 2.992 |
| 1534 | 2.992 |
| 1535 | 2.992 |
| 1536 | 2.992 |
| 1537 | 2.992 |
| 1538 | 2.992 |
| 1539 | 2.992 |
| 1540 | 2.992 |
| 1541 | 2.992 |
| 1542 | 2.992 |
| 1543 | 2.992 |
| 1544 | 2.992 |
| 1545 | 2.992 |
| 1546 | 2.992 |
| 1547 | 2.995 |
| 1548 | 2.995 |
| 1549 | 2.995 |
| 1550 | 2.995 |
| 1551 | 2.995 |
| 1552 | 2.995 |
| 1553 | 2.995 |
| 1554 | 2.995 |
| 1555 | 2.995 |
| 1556 | 2.995 |
| 1557 | 2.995 |
| 1558 | 2.995 |
| 1559 | 2.995 |
| 1560 | 2.995 |
| 1561 | 2.995 |
| 1562 | 2.995 |
| 1563 | 2.995 |
| 1564 | 2.995 |
| 1565 | 2.995 |
| 1566 | 2.995 |
| 1567 | 2.995 |
| 1568 | 2.995 |
| 1569 | 2.995 |
| 1570 | 2.995 |
| 1571 | 2.995 |
| 1572 | 2.995 |
| 1573 | 2.995 |
| 1574 | 2.995 |
| 1575 | 2.995 |
| 1576 | 2.995 |
| 1577 | 3.007 |
| 1578 | 3.007 |
| 1579 | 3.007 |
| 1580 | 3.007 |
| 1581 | 3.007 |
| 1582 | 3.007 |
| 1583 | 3.007 |
| 1584 | 3.007 |
| 1585 | 3.007 |
| 1586 | 3.007 |
| 1587 | 3.007 |
| 1588 | 3.007 |
| 1589 | 3.007 |
| 1590 | 3.007 |
| 1591 | 3.007 |
| 1592 | 3.023 |
| 1593 | 3.023 |
| 1594 | 3.023 |
| 1595 | 3.023 |
| 1596 | 3.023 |
| 1597 | 3.023 |
| 1598 | 3.023 |
| 1599 | 3.023 |
| 1600 | 3.023 |
| 1601 | 3.023 |
| 1602 | 3.023 |
| 1603 | 3.023 |
| 1604 | 3.018 |
| 1605 | 3.018 |
| 1606 | 3.018 |
| 1607 | 3.018 |
| 1608 | 3.018 |
| 1609 | 3.018 |
| 1610 | 3.018 |
| 1611 | 3.018 |
| 1612 | 3.018 |
| 1613 | 3.018 |
| 1614 | 3.018 |
| 1615 | 3.018 |
| 1616 | 3.018 |
| 1617 | 3.018 |
| 1618 | 2.989 |
| 1619 | 2.989 |
| 1620 | 2.989 |
| 1621 | 2.989 |
| 1622 | 2.989 |
| 1623 | 2.989 |
| 1624 | 2.989 |
| 1625 | 2.989 |
| 1626 | 2.989 |
| 1627 | 2.989 |
| 1628 | 2.989 |
| 1629 | 2.989 |
| 1630 | 2.989 |
| 1631 | 2.989 |
| 1632 | 3.021 |
| 1633 | 3.021 |
| 1634 | 3.021 |
| 1635 | 3.021 |
| 1636 | 3.021 |
| 1637 | 3.021 |
| 1638 | 3.021 |
| 1639 | 3.021 |
| 1640 | 3.021 |
| 1641 | 3.021 |
| 1642 | 3.021 |
| 1643 | 3.021 |
| 1644 | 3.021 |
| 1645 | 3.021 |
| 1646 | 2.978 |
| 1647 | 2.978 |
| 1648 | 2.978 |
| 1649 | 2.978 |
| 1650 | 2.978 |
| 1651 | 2.978 |
| 1652 | 2.978 |
| 1653 | 2.978 |
| 1654 | 2.978 |
| 1655 | 2.978 |
| 1656 | 2.978 |
| 1657 | 2.978 |
| 1658 | 2.978 |
| 1659 | 2.978 |
| 1660 | 2.978 |
| 1661 | 2.978 |
| 1662 | 2.978 |
| 1663 | 3.002 |
| 1664 | 3.002 |
| 1665 | 3.002 |
| 1666 | 3.002 |
| 1667 | 3.002 |
| 1668 | 3.002 |
| 1669 | 3.002 |
| 1670 | 3.002 |
| 1671 | 3.002 |
| 1672 | 3.002 |
| 1673 | 3.002 |
| 1674 | 3.002 |
| 1675 | 3.002 |
| 1676 | 3.047 |
| 1677 | 3.047 |
| 1678 | 3.047 |
| 1679 | 3.047 |
| 1680 | 3.047 |
| 1681 | 3.047 |
| 1682 | 3.047 |
| 1683 | 3.047 |
| 1684 | 3.047 |
| 1685 | 3.047 |
| 1686 | 3.047 |
| 1687 | 3.047 |
| 1688 | 3.047 |
| 1689 | 3.047 |
| 1690 | 3.112 |
| 1691 | 3.112 |
| 1692 | 3.112 |
| 1693 | 3.112 |
| 1694 | 3.112 |
| 1695 | 3.112 |
| 1696 | 3.112 |
| 1697 | 3.112 |
| 1698 | 3.112 |
| 1699 | 3.112 |
| 1700 | 3.112 |
| 1701 | 3.112 |
| 1702 | 3.112 |
| 1703 | 3.121 |
| 1704 | 3.121 |
| 1705 | 3.121 |
| 1706 | 3.121 |
| 1707 | 3.121 |
| 1708 | 3.121 |
| 1709 | 3.121 |
| 1710 | 3.121 |
| 1711 | 3.121 |
| 1712 | 3.121 |
| 1713 | 3.121 |
| 1714 | 3.121 |
| 1715 | 3.121 |
| 1716 | 3.121 |
| 1717 | 3.121 |
| 1718 | 3.105 |
| 1719 | 3.105 |
| 1720 | 3.105 |
| 1721 | 3.105 |
| 1722 | 3.105 |
| 1723 | 3.105 |
| 1724 | 3.105 |
| 1725 | 3.105 |
| 1726 | 3.105 |
| 1727 | 3.105 |
| 1728 | 3.105 |
| 1729 | 3.105 |
| 1730 | 3.105 |
| 1731 | 3.149 |
| 1732 | 3.149 |
| 1733 | 3.149 |
| 1734 | 3.149 |
| 1735 | 3.149 |
| 1736 | 3.149 |
| 1737 | 3.149 |
| 1738 | 3.149 |
| 1739 | 3.149 |
| 1740 | 3.149 |
| 1741 | 3.149 |
| 1742 | 3.149 |
| 1743 | 3.149 |
| 1744 | 3.149 |
| 1745 | 3.149 |
| 1746 | 3.212 |
| 1747 | 3.212 |
| 1748 | 3.212 |
| 1749 | 3.212 |
| 1750 | 3.212 |
| 1751 | 3.212 |
| 1752 | 3.212 |
| 1753 | 3.212 |
| 1754 | 3.212 |
| 1755 | 3.212 |
| 1756 | 3.212 |
| 1757 | 3.212 |
| 1758 | 3.212 |
| 1759 | 3.261 |
| 1760 | 3.261 |
| 1761 | 3.261 |
| 1762 | 3.261 |
| 1763 | 3.261 |
| 1764 | 3.261 |
| 1765 | 3.261 |
| 1766 | 3.261 |
| 1767 | 3.261 |
| 1768 | 3.261 |
| 1769 | 3.261 |
| 1770 | 3.261 |
| 1771 | 3.348 |
| 1772 | 3.348 |
| 1773 | 3.348 |
| 1774 | 3.348 |
| 1775 | 3.348 |
| 1776 | 3.348 |
| 1777 | 3.348 |
| 1778 | 3.348 |
| 1779 | 3.348 |
| 1780 | 3.348 |
| 1781 | 3.348 |
| 1782 | 3.348 |
| 1783 | 3.348 |
| 1784 | 3.348 |
| 1785 | 3.348 |
| 1786 | 3.408 |
| 1787 | 3.408 |
| 1788 | 3.408 |
| 1789 | 3.408 |
| 1790 | 3.408 |
| 1791 | 3.408 |
| 1792 | 3.408 |
| 1793 | 3.408 |
| 1794 | 3.408 |
| 1795 | 3.408 |
| 1796 | 3.408 |
| 1797 | 3.408 |
| 1798 | 3.408 |
| 1799 | 3.408 |
| 1800 | 3.446 |
| 1801 | 3.446 |
| 1802 | 3.446 |
| 1803 | 3.446 |
| 1804 | 3.446 |
| 1805 | 3.446 |
| 1806 | 3.446 |
| 1807 | 3.446 |
| 1808 | 3.446 |
| 1809 | 3.446 |
| 1810 | 3.446 |
| 1811 | 3.446 |
| 1812 | 3.474 |
| 1813 | 3.474 |
| 1814 | 3.474 |
| 1815 | 3.474 |
| 1816 | 3.474 |
| 1817 | 3.474 |
| 1818 | 3.474 |
| 1819 | 3.474 |
| 1820 | 3.474 |
| 1821 | 3.474 |
| 1822 | 3.474 |
| 1823 | 3.474 |
| 1824 | 3.474 |
| 1825 | 3.474 |
| 1826 | 3.474 |
| 1827 | 3.429 |
| 1828 | 3.429 |
| 1829 | 3.429 |
| 1830 | 3.429 |
| 1831 | 3.429 |
| 1832 | 3.429 |
| 1833 | 3.429 |
| 1834 | 3.429 |
| 1835 | 3.429 |
| 1836 | 3.429 |
| 1837 | 3.429 |
| 1838 | 3.429 |
| 1839 | 3.429 |
| 1840 | 3.429 |
| 1841 | 3.429 |
| 1842 | 3.345 |
| 1843 | 3.345 |
| 1844 | 3.345 |
| 1845 | 3.345 |
| 1846 | 3.345 |
| 1847 | 3.345 |
| 1848 | 3.345 |
| 1849 | 3.345 |
| 1850 | 3.345 |
| 1851 | 3.345 |
| 1852 | 3.345 |
| 1853 | 3.345 |
| 1854 | 3.345 |
| 1855 | 3.345 |
| 1856 | 3.345 |
| 1857 | 3.293 |
| 1858 | 3.293 |
| 1859 | 3.293 |
| 1860 | 3.293 |
| 1861 | 3.293 |
| 1862 | 3.293 |
| 1863 | 3.293 |
| 1864 | 3.293 |
| 1865 | 3.293 |
| 1866 | 3.293 |
| 1867 | 3.293 |
| 1868 | 3.293 |
| 1869 | 3.299 |
| 1870 | 3.299 |
| 1871 | 3.299 |
| 1872 | 3.299 |
| 1873 | 3.299 |
| 1874 | 3.299 |
| 1875 | 3.299 |
| 1876 | 3.299 |
| 1877 | 3.299 |
| 1878 | 3.299 |
| 1879 | 3.299 |
| 1880 | 3.299 |
| 1881 | 3.339 |
| 1882 | 3.339 |
| 1883 | 3.339 |
| 1884 | 3.339 |
| 1885 | 3.339 |
| 1886 | 3.339 |
| 1887 | 3.339 |
| 1888 | 3.339 |
| 1889 | 3.339 |
| 1890 | 3.339 |
| 1891 | 3.339 |
| 1892 | 3.339 |
| 1893 | 3.339 |
| 1894 | 3.339 |
| 1895 | 3.339 |
| 1896 | 3.339 |
| 1897 | 3.323 |
| 1898 | 3.323 |
| 1899 | 3.323 |
| 1900 | 3.323 |
| 1901 | 3.323 |
| 1902 | 3.323 |
| 1903 | 3.323 |
| 1904 | 3.323 |
| 1905 | 3.323 |
| 1906 | 3.323 |
| 1907 | 3.323 |
| 1908 | 3.323 |
| 1909 | 3.323 |
| 1910 | 3.334 |
| 1911 | 3.334 |
| 1912 | 3.334 |
| 1913 | 3.334 |
| 1914 | 3.334 |
| 1915 | 3.334 |
| 1916 | 3.334 |
| 1917 | 3.334 |
| 1918 | 3.334 |
| 1919 | 3.334 |
| 1920 | 3.334 |
| 1921 | 3.334 |
| 1922 | 3.347 |
| 1923 | 3.347 |
| 1924 | 3.347 |
| 1925 | 3.347 |
| 1926 | 3.347 |
| 1927 | 3.347 |
| 1928 | 3.347 |
| 1929 | 3.347 |
| 1930 | 3.347 |
| 1931 | 3.347 |
| 1932 | 3.347 |
| 1933 | 3.347 |
| 1934 | 3.347 |
| 1935 | 3.347 |
| 1936 | 3.347 |
| 1937 | 3.343 |
| 1938 | 3.343 |
| 1939 | 3.343 |
| 1940 | 3.343 |
| 1941 | 3.343 |
| 1942 | 3.343 |
| 1943 | 3.343 |
| 1944 | 3.343 |
| 1945 | 3.343 |
| 1946 | 3.343 |
| 1947 | 3.343 |
| 1948 | 3.343 |
| 1949 | 3.343 |
| 1950 | 3.343 |
| 1951 | 3.316 |
| 1952 | 3.316 |
| 1953 | 3.316 |
| 1954 | 3.316 |
| 1955 | 3.316 |
| 1956 | 3.316 |
| 1957 | 3.316 |
| 1958 | 3.316 |
| 1959 | 3.316 |
| 1960 | 3.316 |
| 1961 | 3.316 |
| 1962 | 3.316 |
| 1963 | 3.26 |
| 1964 | 3.26 |
| 1965 | 3.26 |
| 1966 | 3.26 |
| 1967 | 3.26 |
| 1968 | 3.26 |
| 1969 | 3.26 |
| 1970 | 3.26 |
| 1971 | 3.26 |
| 1972 | 3.26 |
| 1973 | 3.26 |
| 1974 | 3.26 |
| 1975 | 3.26 |
| 1976 | 3.26 |
| 1977 | 3.26 |
| 1978 | 3.26 |
| 1979 | 3.211 |
| 1980 | 3.211 |
| 1981 | 3.211 |
| 1982 | 3.211 |
| 1983 | 3.211 |
| 1984 | 3.211 |
| 1985 | 3.211 |
| 1986 | 3.211 |
| 1987 | 3.211 |
| 1988 | 3.211 |
| 1989 | 3.211 |
| 1990 | 3.211 |
| 1991 | 3.17 |
| 1992 | 3.17 |
| 1993 | 3.17 |
| 1994 | 3.17 |
| 1995 | 3.17 |
| 1996 | 3.17 |
| 1997 | 3.17 |
| 1998 | 3.17 |
| 1999 | 3.17 |
| 2000 | 3.17 |
| 2001 | 3.17 |
| 2002 | 3.17 |
| 2003 | 3.17 |
| 2004 | 3.17 |
| 2005 | 3.17 |
| 2006 | 3.17 |
| 2007 | 3.227 |
| 2008 | 3.227 |
| 2009 | 3.227 |
| 2010 | 3.227 |
| 2011 | 3.227 |
| 2012 | 3.227 |
| 2013 | 3.227 |
| 2014 | 3.227 |
| 2015 | 3.227 |
| 2016 | 3.227 |
| 2017 | 3.227 |
| 2018 | 3.227 |
| 2019 | 3.198 |
| 2020 | 3.198 |
| 2021 | 3.198 |
| 2022 | 3.198 |
| 2023 | 3.198 |
| 2024 | 3.198 |
| 2025 | 3.198 |
| 2026 | 3.198 |
| 2027 | 3.198 |
| 2028 | 3.198 |
| 2029 | 3.198 |
| 2030 | 3.198 |
| 2031 | 3.198 |
| 2032 | 3.198 |
| 2033 | 3.203 |
| 2034 | 3.203 |
| 2035 | 3.203 |
| 2036 | 3.203 |
| 2037 | 3.203 |
| 2038 | 3.203 |
| 2039 | 3.203 |
| 2040 | 3.203 |
| 2041 | 3.203 |
| 2042 | 3.203 |
| 2043 | 3.203 |
| 2044 | 3.203 |
| 2045 | 3.203 |
| 2046 | 3.203 |
| 2047 | 3.203 |
| 2048 | 3.19 |
| 2049 | 3.19 |
| 2050 | 3.19 |
| 2051 | 3.19 |
| 2052 | 3.19 |
| 2053 | 3.19 |
| 2054 | 3.19 |
| 2055 | 3.19 |
| 2056 | 3.19 |
| 2057 | 3.19 |
| 2058 | 3.19 |
| 2059 | 3.19 |
| 2060 | 3.19 |
| 2061 | 3.19 |
| 2062 | 3.265 |
| 2063 | 3.265 |
| 2064 | 3.265 |
| 2065 | 3.265 |
| 2066 | 3.265 |
| 2067 | 3.265 |
| 2068 | 3.265 |
| 2069 | 3.265 |
| 2070 | 3.265 |
| 2071 | 3.265 |
| 2072 | 3.265 |
| 2073 | 3.29 |
| 2074 | 3.29 |
| 2075 | 3.29 |
| 2076 | 3.29 |
| 2077 | 3.29 |
| 2078 | 3.29 |
| 2079 | 3.29 |
| 2080 | 3.29 |
| 2081 | 3.29 |
| 2082 | 3.29 |
| 2083 | 3.29 |
| 2084 | 3.29 |
| 2085 | 3.29 |
| 2086 | 3.29 |
| 2087 | 3.235 |
| 2088 | 3.235 |
| 2089 | 3.235 |
| 2090 | 3.235 |
| 2091 | 3.235 |
| 2092 | 3.235 |
| 2093 | 3.235 |
| 2094 | 3.235 |
| 2095 | 3.235 |
| 2096 | 3.235 |
| 2097 | 3.235 |
| 2098 | 3.235 |
| 2099 | 3.174 |
| 2100 | 3.174 |
| 2101 | 3.174 |
| 2102 | 3.174 |
| 2103 | 3.174 |
| 2104 | 3.174 |
| 2105 | 3.174 |
| 2106 | 3.174 |
| 2107 | 3.174 |
| 2108 | 3.174 |
| 2109 | 3.174 |
| 2110 | 3.174 |
| 2111 | 3.174 |
| 2112 | 3.174 |
| 2113 | 3.174 |
| 2114 | 3.226 |
| 2115 | 3.226 |
| 2116 | 3.226 |
| 2117 | 3.226 |
| 2118 | 3.226 |
| 2119 | 3.226 |
| 2120 | 3.226 |
| 2121 | 3.226 |
| 2122 | 3.226 |
| 2123 | 3.226 |
| 2124 | 3.226 |
| 2125 | 3.226 |
| 2126 | 3.226 |
| 2127 | 3.226 |
| 2128 | 3.227 |
| 2129 | 3.227 |
| 2130 | 3.227 |
| 2131 | 3.227 |
| 2132 | 3.227 |
| 2133 | 3.227 |
| 2134 | 3.227 |
| 2135 | 3.227 |
| 2136 | 3.227 |
| 2137 | 3.227 |
| 2138 | 3.227 |
| 2139 | 3.227 |
| 2140 | 3.227 |
| 2141 | 3.241 |
| 2142 | 3.241 |
| 2143 | 3.241 |
| 2144 | 3.241 |
| 2145 | 3.241 |
| 2146 | 3.241 |
| 2147 | 3.241 |
| 2148 | 3.241 |
| 2149 | 3.241 |
| 2150 | 3.241 |
| 2151 | 3.241 |
| 2152 | 3.241 |
| 2153 | 3.241 |
| 2154 | 3.241 |
| 2155 | 3.241 |
| 2156 | 3.288 |
| 2157 | 3.288 |
| 2158 | 3.288 |
| 2159 | 3.288 |
| 2160 | 3.288 |
| 2161 | 3.288 |
| 2162 | 3.288 |
| 2163 | 3.288 |
| 2164 | 3.288 |
| 2165 | 3.288 |
| 2166 | 3.288 |
| 2167 | 3.288 |
| 2168 | 3.288 |
| 2169 | 3.288 |
| 2170 | 3.468 |
| 2171 | 3.468 |
| 2172 | 3.468 |
| 2173 | 3.468 |
| 2174 | 3.468 |
| 2175 | 3.468 |
| 2176 | 3.468 |
| 2177 | 3.468 |
| 2178 | 3.468 |
| 2179 | 3.468 |
| 2180 | 3.468 |
| 2181 | 3.468 |
| 2182 | 3.468 |
| 2183 | 3.573 |
| 2184 | 3.573 |
| 2185 | 3.573 |
| 2186 | 3.573 |
| 2187 | 3.573 |
| 2188 | 3.573 |
| 2189 | 3.573 |
| 2190 | 3.573 |
| 2191 | 3.573 |
| 2192 | 3.573 |
| 2193 | 3.573 |
| 2194 | 3.573 |
| 2195 | 3.573 |
| 2196 | 3.573 |
| 2197 | 3.573 |
| 2198 | 3.579 |
| 2199 | 3.579 |
| 2200 | 3.579 |
| 2201 | 3.579 |
| 2202 | 3.579 |
| 2203 | 3.579 |
| 2204 | 3.579 |
| 2205 | 3.579 |
| 2206 | 3.579 |
| 2207 | 3.579 |
| 2208 | 3.579 |
| 2209 | 3.579 |
| 2210 | 3.579 |
| 2211 | 3.579 |
| 2212 | 3.579 |
| 2213 | 3.577 |
| 2214 | 3.577 |
| 2215 | 3.577 |
| 2216 | 3.577 |
| 2217 | 3.577 |
| 2218 | 3.577 |
| 2219 | 3.577 |
| 2220 | 3.577 |
| 2221 | 3.577 |
| 2222 | 3.577 |
| 2223 | 3.577 |
| 2224 | 3.577 |
| 2225 | 3.577 |
| 2226 | 3.577 |
| 2227 | 3.577 |
| 2228 | 3.585 |
| 2229 | 3.585 |
| 2230 | 3.585 |
| 2231 | 3.585 |
| 2232 | 3.585 |
| 2233 | 3.585 |
| 2234 | 3.585 |
| 2235 | 3.585 |
| 2236 | 3.585 |
| 2237 | 3.585 |
| 2238 | 3.585 |
| 2239 | 3.585 |
| 2240 | 3.585 |
| 2241 | 3.585 |
| 2242 | 3.588 |
| 2243 | 3.588 |
| 2244 | 3.588 |
| 2245 | 3.588 |
| 2246 | 3.588 |
| 2247 | 3.588 |
| 2248 | 3.588 |
| 2249 | 3.588 |
| 2250 | 3.588 |
| 2251 | 3.588 |
| 2252 | 3.588 |
| 2253 | 3.588 |
| 2254 | 3.588 |
| 2255 | 3.588 |
| 2256 | 3.588 |
| 2257 | 3.589 |
| 2258 | 3.589 |
| 2259 | 3.589 |
| 2260 | 3.589 |
| 2261 | 3.589 |
| 2262 | 3.589 |
| 2263 | 3.589 |
| 2264 | 3.589 |
| 2265 | 3.589 |
| 2266 | 3.589 |
| 2267 | 3.589 |
| 2268 | 3.589 |
| 2269 | 3.589 |
| 2270 | 3.569 |
| 2271 | 3.569 |
| 2272 | 3.569 |
| 2273 | 3.569 |
| 2274 | 3.569 |
| 2275 | 3.569 |
| 2276 | 3.569 |
| 2277 | 3.569 |
| 2278 | 3.569 |
| 2279 | 3.569 |
| 2280 | 3.569 |
| 2281 | 3.569 |
| 2282 | 3.569 |
| 2283 | 3.604 |
| 2284 | 3.604 |
| 2285 | 3.604 |
| 2286 | 3.604 |
| 2287 | 3.604 |
| 2288 | 3.604 |
| 2289 | 3.604 |
| 2290 | 3.604 |
| 2291 | 3.604 |
| 2292 | 3.604 |
| 2293 | 3.604 |
| 2294 | 3.604 |
| 2295 | 3.604 |
| 2296 | 3.604 |
| 2297 | 3.542 |
| 2298 | 3.542 |
| 2299 | 3.542 |
| 2300 | 3.542 |
| 2301 | 3.542 |
| 2302 | 3.542 |
| 2303 | 3.542 |
| 2304 | 3.542 |
| 2305 | 3.542 |
| 2306 | 3.542 |
| 2307 | 3.542 |
| 2308 | 3.542 |
| 2309 | 3.535 |
| 2310 | 3.535 |
| 2311 | 3.535 |
| 2312 | 3.535 |
| 2313 | 3.535 |
| 2314 | 3.535 |
| 2315 | 3.535 |
| 2316 | 3.535 |
| 2317 | 3.535 |
| 2318 | 3.535 |
| 2319 | 3.535 |
| 2320 | 3.535 |
| 2321 | 3.535 |
| 2322 | 3.535 |
| 2323 | 3.758 |
| 2324 | 3.758 |
| 2325 | 3.758 |
| 2326 | 3.758 |
| 2327 | 3.758 |
| 2328 | 3.758 |
| 2329 | 3.758 |
| 2330 | 3.758 |
| 2331 | 3.758 |
| 2332 | 3.758 |
| 2333 | 3.758 |
| 2334 | 3.758 |
| 2335 | 3.758 |
| 2336 | 3.884 |
| 2337 | 3.884 |
| 2338 | 3.884 |
| 2339 | 3.884 |
| 2340 | 3.884 |
| 2341 | 3.884 |
| 2342 | 3.884 |
| 2343 | 3.884 |
| 2344 | 3.884 |
| 2345 | 3.884 |
| 2346 | 3.884 |
| 2347 | 3.884 |
| 2348 | 3.884 |
| 2349 | 3.91 |
| 2350 | 3.91 |
| 2351 | 3.91 |
| 2352 | 3.91 |
| 2353 | 3.91 |
| 2354 | 3.91 |
| 2355 | 3.91 |
| 2356 | 3.91 |
| 2357 | 3.91 |
| 2358 | 3.91 |
| 2359 | 3.91 |
| 2360 | 3.91 |
| 2361 | 3.91 |
| 2362 | 3.91 |
| 2363 | 3.917 |
| 2364 | 3.917 |
| 2365 | 3.917 |
| 2366 | 3.917 |
| 2367 | 3.917 |
| 2368 | 3.917 |
| 2369 | 3.917 |
| 2370 | 3.917 |
| 2371 | 3.917 |
| 2372 | 3.917 |
| 2373 | 3.917 |
| 2374 | 3.917 |
| 2375 | 3.917 |
| 2376 | 3.899 |
| 2377 | 3.899 |
| 2378 | 3.899 |
| 2379 | 3.899 |
| 2380 | 3.899 |
| 2381 | 3.899 |
| 2382 | 3.899 |
| 2383 | 3.899 |
| 2384 | 3.899 |
| 2385 | 3.899 |
| 2386 | 3.899 |
| 2387 | 3.9 |
| 2388 | 3.9 |
| 2389 | 3.9 |
| 2390 | 3.9 |
| 2391 | 3.9 |
| 2392 | 3.9 |
| 2393 | 3.9 |
| 2394 | 3.9 |
| 2395 | 3.9 |
| 2396 | 3.9 |
| 2397 | 3.9 |
| 2398 | 3.9 |
| 2399 | 3.9 |
| 2400 | 3.9 |
| 2401 | 3.854 |
| 2402 | 3.854 |
| 2403 | 3.854 |
| 2404 | 3.854 |
| 2405 | 3.854 |
| 2406 | 3.854 |
| 2407 | 3.854 |
| 2408 | 3.854 |
| 2409 | 3.854 |
| 2410 | 3.854 |
| 2411 | 3.854 |
| 2412 | 3.854 |
| 2413 | 3.797 |
| 2414 | 3.797 |
| 2415 | 3.797 |
| 2416 | 3.797 |
| 2417 | 3.797 |
| 2418 | 3.797 |
| 2419 | 3.797 |
| 2420 | 3.797 |
| 2421 | 3.797 |
| 2422 | 3.797 |
| 2423 | 3.797 |
| 2424 | 3.797 |
| 2425 | 3.797 |
| 2426 | 3.797 |
| 2427 | 3.804 |
| 2428 | 3.804 |
| 2429 | 3.804 |
| 2430 | 3.804 |
| 2431 | 3.804 |
| 2432 | 3.804 |
| 2433 | 3.804 |
| 2434 | 3.804 |
| 2435 | 3.804 |
| 2436 | 3.804 |
| 2437 | 3.804 |
| 2438 | 3.804 |
| 2439 | 3.804 |
| 2440 | 3.804 |
| 2441 | 3.815 |
| 2442 | 3.815 |
| 2443 | 3.815 |
| 2444 | 3.815 |
| 2445 | 3.815 |
| 2446 | 3.815 |
| 2447 | 3.815 |
| 2448 | 3.815 |
| 2449 | 3.815 |
| 2450 | 3.815 |
| 2451 | 3.815 |
| 2452 | 3.815 |
| 2453 | 3.815 |
| 2454 | 3.815 |
| 2455 | 3.846 |
| 2456 | 3.846 |
| 2457 | 3.846 |
| 2458 | 3.846 |
| 2459 | 3.846 |
| 2460 | 3.846 |
| 2461 | 3.846 |
| 2462 | 3.846 |
| 2463 | 3.846 |
| 2464 | 3.846 |
| 2465 | 3.846 |
| 2466 | 3.846 |
| 2467 | 3.846 |
| 2468 | 3.869 |
| 2469 | 3.869 |
| 2470 | 3.869 |
| 2471 | 3.869 |
| 2472 | 3.869 |
| 2473 | 3.869 |
| 2474 | 3.869 |
| 2475 | 3.869 |
| 2476 | 3.869 |
| 2477 | 3.869 |
| 2478 | 3.869 |
| 2479 | 3.869 |
| 2480 | 3.869 |
| 2481 | 3.869 |
| 2482 | 3.869 |
| 2483 | 3.877 |
| 2484 | 3.877 |
| 2485 | 3.877 |
| 2486 | 3.877 |
| 2487 | 3.877 |
| 2488 | 3.877 |
| 2489 | 3.877 |
| 2490 | 3.877 |
| 2491 | 3.877 |
| 2492 | 3.877 |
| 2493 | 3.877 |
| 2494 | 3.877 |
| 2495 | 3.877 |
| 2496 | 3.877 |
| 2497 | 3.877 |
| 2498 | 3.877 |
| 2499 | 3.807 |
| 2500 | 3.807 |
| 2501 | 3.807 |
| 2502 | 3.807 |
| 2503 | 3.807 |
| 2504 | 3.807 |
| 2505 | 3.807 |
| 2506 | 3.807 |
| 2507 | 3.807 |
| 2508 | 3.807 |
| 2509 | 3.807 |
| 2510 | 3.807 |
| 2511 | 3.807 |
| 2512 | 3.754 |
| 2513 | 3.754 |
| 2514 | 3.754 |
| 2515 | 3.754 |
| 2516 | 3.754 |
| 2517 | 3.754 |
| 2518 | 3.754 |
| 2519 | 3.754 |
| 2520 | 3.754 |
| 2521 | 3.754 |
| 2522 | 3.754 |
| 2523 | 3.754 |
| 2524 | 3.754 |
| 2525 | 3.754 |
| 2526 | 3.754 |
| 2527 | 3.78 |
| 2528 | 3.78 |
| 2529 | 3.78 |
| 2530 | 3.78 |
| 2531 | 3.78 |
| 2532 | 3.78 |
| 2533 | 3.78 |
| 2534 | 3.78 |
| 2535 | 3.78 |
| 2536 | 3.78 |
| 2537 | 3.78 |
| 2538 | 3.78 |
| 2539 | 3.778 |
| 2540 | 3.778 |
| 2541 | 3.778 |
| 2542 | 3.778 |
| 2543 | 3.778 |
| 2544 | 3.778 |
| 2545 | 3.778 |
| 2546 | 3.778 |
| 2547 | 3.778 |
| 2548 | 3.778 |
| 2549 | 3.778 |
| 2550 | 3.778 |
| 2551 | 3.778 |
| 2552 | 3.778 |
| 2553 | 3.759 |
| 2554 | 3.759 |
| 2555 | 3.759 |
| 2556 | 3.759 |
| 2557 | 3.759 |
| 2558 | 3.759 |
| 2559 | 3.759 |
| 2560 | 3.759 |
| 2561 | 3.759 |
| 2562 | 3.759 |
| 2563 | 3.759 |
| 2564 | 3.759 |
| 2565 | 3.759 |
| 2566 | 3.759 |
| 2567 | 3.759 |
| 2568 | 3.774 |
| 2569 | 3.774 |
| 2570 | 3.774 |
| 2571 | 3.774 |
| 2572 | 3.774 |
| 2573 | 3.774 |
| 2574 | 3.774 |
| 2575 | 3.774 |
| 2576 | 3.774 |
| 2577 | 3.774 |
| 2578 | 3.774 |
| 2579 | 3.774 |
| 2580 | 3.776 |
| 2581 | 3.776 |
| 2582 | 3.776 |
| 2583 | 3.776 |
| 2584 | 3.776 |
| 2585 | 3.776 |
| 2586 | 3.776 |
| 2587 | 3.776 |
| 2588 | 3.776 |
| 2589 | 3.776 |
| 2590 | 3.776 |
| 2591 | 3.776 |
| 2592 | 3.776 |
| 2593 | 3.776 |
| 2594 | 3.72 |
| 2595 | 3.72 |
| 2596 | 3.72 |
| 2597 | 3.72 |
| 2598 | 3.72 |
| 2599 | 3.72 |
| 2600 | 3.72 |
| 2601 | 3.72 |
| 2602 | 3.72 |
| 2603 | 3.72 |
| 2604 | 3.72 |
| 2605 | 3.72 |
| 2606 | 3.72 |
| 2607 | 3.72 |
| 2608 | 3.72 |
| 2609 | 3.72 |
| 2610 | 3.687 |
| 2611 | 3.687 |
| 2612 | 3.687 |
| 2613 | 3.687 |
| 2614 | 3.687 |
| 2615 | 3.687 |
| 2616 | 3.687 |
| 2617 | 3.687 |
| 2618 | 3.687 |
| 2619 | 3.687 |
| 2620 | 3.687 |
| 2621 | 3.687 |
| 2622 | 3.729 |
| 2623 | 3.729 |
| 2624 | 3.729 |
| 2625 | 3.729 |
| 2626 | 3.729 |
| 2627 | 3.729 |
| 2628 | 3.729 |
| 2629 | 3.729 |
| 2630 | 3.729 |
| 2631 | 3.729 |
| 2632 | 3.729 |
| 2633 | 3.729 |
| 2634 | 3.729 |
| 2635 | 3.729 |
| 2636 | 3.733 |
| 2637 | 3.733 |
| 2638 | 3.733 |
| 2639 | 3.733 |
| 2640 | 3.733 |
| 2641 | 3.733 |
| 2642 | 3.733 |
| 2643 | 3.733 |
| 2644 | 3.733 |
| 2645 | 3.733 |
| 2646 | 3.733 |
| 2647 | 3.733 |
| 2648 | 3.733 |
| 2649 | 3.733 |
| 2650 | 3.698 |
| 2651 | 3.698 |
| 2652 | 3.698 |
| 2653 | 3.698 |
| 2654 | 3.698 |
| 2655 | 3.698 |
| 2656 | 3.698 |
| 2657 | 3.698 |
| 2658 | 3.698 |
| 2659 | 3.698 |
| 2660 | 3.698 |
| 2661 | 3.698 |
| 2662 | 3.703 |
| 2663 | 3.703 |
| 2664 | 3.703 |
| 2665 | 3.703 |
| 2666 | 3.703 |
| 2667 | 3.703 |
| 2668 | 3.703 |
| 2669 | 3.703 |
| 2670 | 3.703 |
| 2671 | 3.703 |
| 2672 | 3.703 |
| 2673 | 3.703 |
| 2674 | 3.703 |
| 2675 | 3.664 |
| 2676 | 3.664 |
| 2677 | 3.664 |
| 2678 | 3.664 |
| 2679 | 3.664 |
| 2680 | 3.664 |
| 2681 | 3.664 |
| 2682 | 3.664 |
| 2683 | 3.664 |
| 2684 | 3.664 |
| 2685 | 3.664 |
| 2686 | 3.664 |
| 2687 | 3.664 |
| 2688 | 3.664 |
| 2689 | 3.664 |
| 2690 | 3.664 |
| 2691 | 3.688 |
| 2692 | 3.688 |
| 2693 | 3.688 |
| 2694 | 3.688 |
| 2695 | 3.688 |
| 2696 | 3.688 |
| 2697 | 3.688 |
| 2698 | 3.688 |
| 2699 | 3.688 |
| 2700 | 3.688 |
| 2701 | 3.688 |
| 2702 | 3.81 |
| 2703 | 3.81 |
| 2704 | 3.81 |
| 2705 | 3.81 |
| 2706 | 3.81 |
| 2707 | 3.81 |
| 2708 | 3.81 |
| 2709 | 3.81 |
| 2710 | 3.81 |
| 2711 | 3.81 |
| 2712 | 3.81 |
| 2713 | 3.81 |
| 2714 | 3.81 |
| 2715 | 3.829 |
| 2716 | 3.829 |
| 2717 | 3.829 |
| 2718 | 3.829 |
| 2719 | 3.829 |
| 2720 | 3.829 |
| 2721 | 3.829 |
| 2722 | 3.829 |
| 2723 | 3.829 |
| 2724 | 3.829 |
| 2725 | 3.829 |
| 2726 | 3.829 |
| 2727 | 3.829 |
| 2728 | 3.829 |
| 2729 | 3.817 |
| 2730 | 3.817 |
| 2731 | 3.817 |
| 2732 | 3.817 |
| 2733 | 3.817 |
| 2734 | 3.817 |
| 2735 | 3.817 |
| 2736 | 3.817 |
| 2737 | 3.817 |
| 2738 | 3.817 |
| 2739 | 3.817 |
| 2740 | 3.817 |
| 2741 | 3.817 |
| 2742 | 3.817 |
| 2743 | 3.817 |
| 2744 | 3.817 |
| 2745 | 3.785 |
| 2746 | 3.785 |
| 2747 | 3.785 |
| 2748 | 3.785 |
| 2749 | 3.785 |
| 2750 | 3.785 |
| 2751 | 3.785 |
| 2752 | 3.785 |
| 2753 | 3.785 |
| 2754 | 3.785 |
| 2755 | 3.785 |
| 2756 | 3.737 |
| 2757 | 3.737 |
| 2758 | 3.737 |
| 2759 | 3.737 |
| 2760 | 3.737 |
| 2761 | 3.737 |
| 2762 | 3.737 |
| 2763 | 3.737 |
| 2764 | 3.737 |
| 2765 | 3.737 |
| 2766 | 3.737 |
| 2767 | 3.737 |
| 2768 | 3.737 |
| 2769 | 3.668 |
| 2770 | 3.668 |
| 2771 | 3.668 |
| 2772 | 3.668 |
| 2773 | 3.668 |
| 2774 | 3.668 |
| 2775 | 3.668 |
| 2776 | 3.668 |
| 2777 | 3.668 |
| 2778 | 3.668 |
| 2779 | 3.668 |
| 2780 | 3.668 |
| 2781 | 3.668 |
| 2782 | 3.668 |
| 2783 | 3.721 |
| 2784 | 3.721 |
| 2785 | 3.721 |
| 2786 | 3.721 |
| 2787 | 3.721 |
| 2788 | 3.721 |
| 2789 | 3.721 |
| 2790 | 3.721 |
| 2791 | 3.721 |
| 2792 | 3.721 |
| 2793 | 3.721 |
| 2794 | 3.721 |
| 2795 | 3.801 |
| 2796 | 3.801 |
| 2797 | 3.801 |
| 2798 | 3.801 |
| 2799 | 3.801 |
| 2800 | 3.801 |
| 2801 | 3.801 |
| 2802 | 3.801 |
| 2803 | 3.801 |
| 2804 | 3.801 |
| 2805 | 3.801 |
| 2806 | 3.801 |
| 2807 | 3.801 |
| 2808 | 3.801 |
| 2809 | 3.853 |
| 2810 | 3.853 |
| 2811 | 3.853 |
| 2812 | 3.853 |
| 2813 | 3.853 |
| 2814 | 3.853 |
| 2815 | 3.853 |
| 2816 | 3.853 |
| 2817 | 3.853 |
| 2818 | 3.853 |
| 2819 | 3.853 |
| 2820 | 3.853 |
| 2821 | 3.853 |
| 2822 | 3.853 |
| 2823 | 3.853 |
| 2824 | 3.823 |
| 2825 | 3.823 |
| 2826 | 3.823 |
| 2827 | 3.823 |
| 2828 | 3.823 |
| 2829 | 3.823 |
| 2830 | 3.823 |
| 2831 | 3.823 |
| 2832 | 3.823 |
| 2833 | 3.823 |
| 2834 | 3.823 |
| 2835 | 3.823 |
| 2836 | 3.823 |
| 2837 | 3.823 |
| 2838 | 3.751 |
| 2839 | 3.751 |
| 2840 | 3.751 |
| 2841 | 3.751 |
| 2842 | 3.751 |
| 2843 | 3.751 |
| 2844 | 3.751 |
| 2845 | 3.751 |
| 2846 | 3.751 |
| 2847 | 3.751 |
| 2848 | 3.751 |
| 2849 | 3.751 |
| 2850 | 3.766 |
| 2851 | 3.766 |
| 2852 | 3.766 |
| 2853 | 3.766 |
| 2854 | 3.766 |
| 2855 | 3.766 |
| 2856 | 3.766 |
| 2857 | 3.766 |
| 2858 | 3.766 |
| 2859 | 3.766 |
| 2860 | 3.766 |
| 2861 | 3.766 |
| 2862 | 3.766 |
| 2863 | 3.815 |
| 2864 | 3.815 |
| 2865 | 3.815 |
| 2866 | 3.815 |
| 2867 | 3.815 |
| 2868 | 3.815 |
| 2869 | 3.815 |
| 2870 | 3.815 |
| 2871 | 3.815 |
| 2872 | 3.815 |
| 2873 | 3.815 |
| 2874 | 3.815 |
| 2875 | 3.815 |
| 2876 | 3.815 |
| 2877 | 3.815 |
| 2878 | 3.847 |
| 2879 | 3.847 |
| 2880 | 3.847 |
| 2881 | 3.847 |
| 2882 | 3.847 |
| 2883 | 3.847 |
| 2884 | 3.847 |
| 2885 | 3.847 |
| 2886 | 3.847 |
| 2887 | 3.847 |
| 2888 | 3.847 |
| 2889 | 3.847 |
| 2890 | 3.847 |
| 2891 | 3.844 |
| 2892 | 3.844 |
| 2893 | 3.844 |
| 2894 | 3.844 |
| 2895 | 3.844 |
| 2896 | 3.844 |
| 2897 | 3.844 |
| 2898 | 3.844 |
| 2899 | 3.844 |
| 2900 | 3.844 |
| 2901 | 3.844 |
| 2902 | 3.844 |
| 2903 | 3.841 |
| 2904 | 3.841 |
| 2905 | 3.841 |
| 2906 | 3.841 |
| 2907 | 3.841 |
| 2908 | 3.841 |
| 2909 | 3.841 |
| 2910 | 3.841 |
| 2911 | 3.841 |
| 2912 | 3.841 |
| 2913 | 3.841 |
| 2914 | 3.841 |
| 2915 | 3.841 |
| 2916 | 3.841 |
| 2917 | 3.841 |
| 2918 | 3.825 |
| 2919 | 3.825 |
| 2920 | 3.825 |
| 2921 | 3.825 |
| 2922 | 3.825 |
| 2923 | 3.825 |
| 2924 | 3.825 |
| 2925 | 3.825 |
| 2926 | 3.825 |
| 2927 | 3.825 |
| 2928 | 3.825 |
| 2929 | 3.825 |
| 2930 | 3.825 |
| 2931 | 3.825 |
| 2932 | 3.835 |
| 2933 | 3.835 |
| 2934 | 3.835 |
| 2935 | 3.835 |
| 2936 | 3.835 |
| 2937 | 3.835 |
| 2938 | 3.835 |
| 2939 | 3.835 |
| 2940 | 3.835 |
| 2941 | 3.835 |
| 2942 | 3.835 |
| 2943 | 3.835 |
| 2944 | 3.835 |
| 2945 | 3.835 |
| 2946 | 3.803 |
| 2947 | 3.803 |
| 2948 | 3.803 |
| 2949 | 3.803 |
| 2950 | 3.803 |
| 2951 | 3.803 |
| 2952 | 3.803 |
| 2953 | 3.803 |
| 2954 | 3.803 |
| 2955 | 3.803 |
| 2956 | 3.803 |
| 2957 | 3.803 |
| 2958 | 3.803 |
| 2959 | 3.803 |
| 2960 | 3.494 |
| 2961 | 3.494 |
| 2962 | 3.494 |
| 2963 | 3.494 |
| 2964 | 3.494 |
| 2965 | 3.494 |
| 2966 | 3.494 |
| 2967 | 3.494 |
| 2968 | 3.494 |
| 2969 | 3.494 |
| 2970 | 3.494 |
| 2971 | 3.494 |
| 2972 | 3.494 |
| 2973 | 3.494 |
| 2974 | 3.494 |
| 2975 | 3.49 |
| 2976 | 3.49 |
| 2977 | 3.49 |
| 2978 | 3.49 |
| 2979 | 3.49 |
| 2980 | 3.49 |
| 2981 | 3.49 |
| 2982 | 3.49 |
| 2983 | 3.49 |
| 2984 | 3.49 |
| 2985 | 3.49 |
| 2986 | 3.49 |
| 2987 | 3.49 |
| 2988 | 3.597 |
| 2989 | 3.597 |
| 2990 | 3.597 |
| 2991 | 3.597 |
| 2992 | 3.597 |
| 2993 | 3.597 |
| 2994 | 3.597 |
| 2995 | 3.597 |
| 2996 | 3.597 |
| 2997 | 3.597 |
| 2998 | 3.597 |
| 2999 | 3.597 |
| 3000 | 3.597 |
| 3001 | 3.597 |
| 3002 | 3.597 |
| 3003 | 3.576 |
| 3004 | 3.576 |
| 3005 | 3.576 |
| 3006 | 3.576 |
| 3007 | 3.576 |
| 3008 | 3.576 |
| 3009 | 3.576 |
| 3010 | 3.576 |
| 3011 | 3.576 |
| 3012 | 3.576 |
| 3013 | 3.576 |
| 3014 | 3.576 |
| 3015 | 3.576 |
| 3016 | 3.593 |
| 3017 | 3.593 |
| 3018 | 3.593 |
| 3019 | 3.593 |
| 3020 | 3.593 |
| 3021 | 3.593 |
| 3022 | 3.593 |
| 3023 | 3.593 |
| 3024 | 3.593 |
| 3025 | 3.593 |
| 3026 | 3.593 |
| 3027 | 3.593 |
| 3028 | 3.593 |
| 3029 | 3.593 |
| 3030 | 3.593 |
| 3031 | 3.593 |
| 3032 | 3.593 |
| 3033 | 3.593 |
| 3034 | 3.593 |
| 3035 | 3.593 |
| 3036 | 3.593 |
| 3037 | 3.593 |
| 3038 | 3.593 |
| 3039 | 3.593 |
| 3040 | 3.593 |
| 3041 | 3.593 |
| 3042 | 3.593 |
| 3043 | 3.593 |
| 3044 | 3.593 |
| 3045 | 3.593 |
| 3046 | 3.602 |
| 3047 | 3.602 |
| 3048 | 3.602 |
| 3049 | 3.602 |
| 3050 | 3.602 |
| 3051 | 3.602 |
| 3052 | 3.602 |
| 3053 | 3.602 |
| 3054 | 3.602 |
| 3055 | 3.602 |
| 3056 | 3.602 |
| 3057 | 3.602 |
| 3058 | 3.602 |
| 3059 | 3.645 |
| 3060 | 3.645 |
| 3061 | 3.645 |
| 3062 | 3.645 |
| 3063 | 3.645 |
| 3064 | 3.645 |
| 3065 | 3.645 |
| 3066 | 3.645 |
| 3067 | 3.645 |
| 3068 | 3.645 |
| 3069 | 3.645 |
| 3070 | 3.645 |
| 3071 | 3.67 |
| 3072 | 3.67 |
| 3073 | 3.67 |
| 3074 | 3.67 |
| 3075 | 3.67 |
| 3076 | 3.67 |
| 3077 | 3.67 |
| 3078 | 3.67 |
| 3079 | 3.67 |
| 3080 | 3.67 |
| 3081 | 3.67 |
| 3082 | 3.67 |
| 3083 | 3.67 |
| 3084 | 3.67 |
| 3085 | 3.67 |
| 3086 | 3.67 |
| 3087 | 3.679 |
| 3088 | 3.679 |
| 3089 | 3.679 |
| 3090 | 3.679 |
| 3091 | 3.679 |
| 3092 | 3.679 |
| 3093 | 3.679 |
| 3094 | 3.679 |
| 3095 | 3.679 |
| 3096 | 3.679 |
| 3097 | 3.679 |
| 3098 | 3.679 |
| 3099 | 3.666 |
| 3100 | 3.666 |
| 3101 | 3.666 |
| 3102 | 3.666 |
| 3103 | 3.666 |
| 3104 | 3.666 |
| 3105 | 3.666 |
| 3106 | 3.666 |
| 3107 | 3.666 |
| 3108 | 3.666 |
| 3109 | 3.666 |
| 3110 | 3.666 |
| 3111 | 3.666 |
| 3112 | 3.666 |
| 3113 | 3.666 |
| 3114 | 3.666 |
| 3115 | 3.659 |
| 3116 | 3.659 |
| 3117 | 3.659 |
| 3118 | 3.659 |
| 3119 | 3.659 |
| 3120 | 3.659 |
| 3121 | 3.659 |
| 3122 | 3.659 |
| 3123 | 3.659 |
| 3124 | 3.659 |
| 3125 | 3.659 |
| 3126 | 3.659 |
| 3127 | 3.659 |
| 3128 | 3.659 |
| 3129 | 3.664 |
| 3130 | 3.664 |
| 3131 | 3.664 |
| 3132 | 3.664 |
| 3133 | 3.664 |
| 3134 | 3.664 |
| 3135 | 3.664 |
| 3136 | 3.664 |
| 3137 | 3.664 |
| 3138 | 3.664 |
| 3139 | 3.664 |
| 3140 | 3.664 |
| 3141 | 3.664 |
| 3142 | 3.664 |
| 3143 | 3.603 |
| 3144 | 3.603 |
| 3145 | 3.603 |
| 3146 | 3.603 |
| 3147 | 3.603 |
| 3148 | 3.603 |
| 3149 | 3.603 |
| 3150 | 3.603 |
| 3151 | 3.603 |
| 3152 | 3.603 |
| 3153 | 3.603 |
| 3154 | 3.603 |
| 3155 | 3.516 |
| 3156 | 3.516 |
| 3157 | 3.516 |
| 3158 | 3.516 |
| 3159 | 3.516 |
| 3160 | 3.516 |
| 3161 | 3.516 |
| 3162 | 3.516 |
| 3163 | 3.516 |
| 3164 | 3.516 |
| 3165 | 3.516 |
| 3166 | 3.516 |
| 3167 | 3.516 |
| 3168 | 3.5 |
| 3169 | 3.5 |
| 3170 | 3.5 |
| 3171 | 3.5 |
| 3172 | 3.5 |
| 3173 | 3.5 |
| 3174 | 3.5 |
| 3175 | 3.5 |
| 3176 | 3.5 |
| 3177 | 3.5 |
| 3178 | 3.5 |
| 3179 | 3.5 |
| 3180 | 3.5 |
| 3181 | 3.5 |
| 3182 | 3.5 |
| 3183 | 3.503 |
| 3184 | 3.503 |
| 3185 | 3.503 |
| 3186 | 3.503 |
| 3187 | 3.503 |
| 3188 | 3.503 |
| 3189 | 3.503 |
| 3190 | 3.503 |
| 3191 | 3.503 |
| 3192 | 3.503 |
| 3193 | 3.503 |
| 3194 | 3.503 |
| 3195 | 3.533 |
| 3196 | 3.533 |
| 3197 | 3.533 |
| 3198 | 3.533 |
| 3199 | 3.533 |
| 3200 | 3.533 |
| 3201 | 3.533 |
| 3202 | 3.533 |
| 3203 | 3.533 |
| 3204 | 3.533 |
| 3205 | 3.533 |
| 3206 | 3.533 |
| 3207 | 3.533 |
| 3208 | 3.558 |
| 3209 | 3.558 |
| 3210 | 3.558 |
| 3211 | 3.558 |
| 3212 | 3.558 |
| 3213 | 3.558 |
| 3214 | 3.558 |
| 3215 | 3.558 |
| 3216 | 3.558 |
| 3217 | 3.558 |
| 3218 | 3.558 |
| 3219 | 3.558 |
| 3220 | 3.558 |
| 3221 | 3.558 |
| 3222 | 3.558 |
| 3223 | 3.551 |
| 3224 | 3.551 |
| 3225 | 3.551 |
| 3226 | 3.551 |
| 3227 | 3.551 |
| 3228 | 3.551 |
| 3229 | 3.551 |
| 3230 | 3.551 |
| 3231 | 3.551 |
| 3232 | 3.551 |
| 3233 | 3.551 |
| 3234 | 3.551 |
| 3235 | 3.551 |
| 3236 | 3.551 |
| 3237 | 3.562 |
| 3238 | 3.562 |
| 3239 | 3.562 |
| 3240 | 3.562 |
| 3241 | 3.562 |
| 3242 | 3.562 |
| 3243 | 3.562 |
| 3244 | 3.562 |
| 3245 | 3.562 |
| 3246 | 3.562 |
| 3247 | 3.562 |
| 3248 | 3.562 |
| 3249 | 3.562 |
| 3250 | 3.562 |
| 3251 | 3.569 |
| 3252 | 3.569 |
| 3253 | 3.569 |
| 3254 | 3.569 |
| 3255 | 3.569 |
| 3256 | 3.569 |
| 3257 | 3.569 |
| 3258 | 3.569 |
| 3259 | 3.569 |
| 3260 | 3.569 |
| 3261 | 3.569 |
| 3262 | 3.569 |
| 3263 | 3.569 |
| 3264 | 3.569 |
| 3265 | 3.574 |
| 3266 | 3.574 |
| 3267 | 3.574 |
| 3268 | 3.574 |
| 3269 | 3.574 |
| 3270 | 3.574 |
| 3271 | 3.574 |
| 3272 | 3.574 |
| 3273 | 3.574 |
| 3274 | 3.574 |
| 3275 | 3.574 |
| 3276 | 3.574 |
| 3277 | 3.574 |
| 3278 | 3.564 |
| 3279 | 3.564 |
| 3280 | 3.564 |
| 3281 | 3.564 |
| 3282 | 3.564 |
| 3283 | 3.564 |
| 3284 | 3.564 |
| 3285 | 3.564 |
| 3286 | 3.564 |
| 3287 | 3.564 |
| 3288 | 3.564 |
| 3289 | 3.564 |
| 3290 | 3.564 |
| 3291 | 3.564 |
| 3292 | 3.564 |
| 3293 | 3.564 |
| 3294 | 3.566 |
| 3295 | 3.566 |
| 3296 | 3.566 |
| 3297 | 3.566 |
| 3298 | 3.566 |
| 3299 | 3.566 |
| 3300 | 3.566 |
| 3301 | 3.566 |
| 3302 | 3.566 |
| 3303 | 3.566 |
| 3304 | 3.566 |
| 3305 | 3.567 |
| 3306 | 3.567 |
| 3307 | 3.567 |
| 3308 | 3.567 |
| 3309 | 3.567 |
| 3310 | 3.567 |
| 3311 | 3.567 |
| 3312 | 3.567 |
| 3313 | 3.567 |
| 3314 | 3.567 |
| 3315 | 3.567 |
| 3316 | 3.567 |
| 3317 | 3.567 |
| 3318 | 3.567 |
| 3319 | 3.567 |
| 3320 | 3.567 |
| 3321 | 3.561 |
| 3322 | 3.561 |
| 3323 | 3.561 |
| 3324 | 3.561 |
| 3325 | 3.561 |
| 3326 | 3.561 |
| 3327 | 3.561 |
| 3328 | 3.561 |
| 3329 | 3.561 |
| 3330 | 3.561 |
| 3331 | 3.561 |
| 3332 | 3.561 |
| 3333 | 3.543 |
| 3334 | 3.543 |
| 3335 | 3.543 |
| 3336 | 3.543 |
| 3337 | 3.543 |
| 3338 | 3.543 |
| 3339 | 3.543 |
| 3340 | 3.543 |
| 3341 | 3.543 |
| 3342 | 3.543 |
| 3343 | 3.543 |
| 3344 | 3.543 |
| 3345 | 3.543 |
| 3346 | 3.543 |
| 3347 | 3.544 |
| 3348 | 3.544 |
| 3349 | 3.544 |
| 3350 | 3.544 |
| 3351 | 3.544 |
| 3352 | 3.544 |
| 3353 | 3.544 |
| 3354 | 3.544 |
| 3355 | 3.544 |
| 3356 | 3.544 |
| 3357 | 3.544 |
| 3358 | 3.544 |
| 3359 | 3.56 |
| 3360 | 3.56 |
| 3361 | 3.56 |
| 3362 | 3.56 |
| 3363 | 3.56 |
| 3364 | 3.56 |
| 3365 | 3.56 |
| 3366 | 3.56 |
| 3367 | 3.56 |
| 3368 | 3.56 |
| 3369 | 3.56 |
| 3370 | 3.56 |
| 3371 | 3.56 |
| 3372 | 3.56 |
| 3373 | 3.608 |
| 3374 | 3.608 |
| 3375 | 3.608 |
| 3376 | 3.608 |
| 3377 | 3.608 |
| 3378 | 3.608 |
| 3379 | 3.608 |
| 3380 | 3.608 |
| 3381 | 3.608 |
| 3382 | 3.608 |
| 3383 | 3.608 |
| 3384 | 3.608 |
| 3385 | 3.608 |
| 3386 | 3.627 |
| 3387 | 3.627 |
| 3388 | 3.627 |
| 3389 | 3.627 |
| 3390 | 3.627 |
| 3391 | 3.627 |
| 3392 | 3.627 |
| 3393 | 3.627 |
| 3394 | 3.627 |
| 3395 | 3.627 |
| 3396 | 3.627 |
| 3397 | 3.627 |
| 3398 | 3.627 |
| 3399 | 3.627 |
| 3400 | 3.627 |
| 3401 | 3.627 |
| 3402 | 3.627 |
| 3403 | 3.624 |
| 3404 | 3.624 |
| 3405 | 3.624 |
| 3406 | 3.624 |
| 3407 | 3.624 |
| 3408 | 3.624 |
| 3409 | 3.624 |
| 3410 | 3.624 |
| 3411 | 3.624 |
| 3412 | 3.624 |
| 3413 | 3.624 |
| 3414 | 3.624 |
| 3415 | 3.624 |
| 3416 | 3.63 |
| 3417 | 3.63 |
| 3418 | 3.63 |
| 3419 | 3.63 |
| 3420 | 3.63 |
| 3421 | 3.63 |
| 3422 | 3.63 |
| 3423 | 3.63 |
| 3424 | 3.63 |
| 3425 | 3.63 |
| 3426 | 3.63 |
| 3427 | 3.63 |
| 3428 | 3.633 |
| 3429 | 3.633 |
| 3430 | 3.633 |
| 3431 | 3.633 |
| 3432 | 3.633 |
| 3433 | 3.633 |
| 3434 | 3.633 |
| 3435 | 3.633 |
| 3436 | 3.633 |
| 3437 | 3.633 |
| 3438 | 3.633 |
| 3439 | 3.633 |
| 3440 | 3.633 |
| 3441 | 3.633 |
| 3442 | 3.633 |
| 3443 | 3.633 |
| 3444 | 3.624 |
| 3445 | 3.624 |
| 3446 | 3.624 |
| 3447 | 3.624 |
| 3448 | 3.624 |
| 3449 | 3.624 |
| 3450 | 3.624 |
| 3451 | 3.624 |
| 3452 | 3.624 |
| 3453 | 3.624 |
| 3454 | 3.624 |
| 3455 | 3.624 |
| 3456 | 3.63 |
| 3457 | 3.63 |
| 3458 | 3.63 |
| 3459 | 3.63 |
| 3460 | 3.63 |
| 3461 | 3.63 |
| 3462 | 3.63 |
| 3463 | 3.63 |
| 3464 | 3.63 |
| 3465 | 3.63 |
| 3466 | 3.63 |
| 3467 | 3.63 |
| 3468 | 3.63 |
| 3469 | 3.63 |
| 3470 | 3.641 |
| 3471 | 3.641 |
| 3472 | 3.641 |
| 3473 | 3.641 |
| 3474 | 3.641 |
| 3475 | 3.641 |
| 3476 | 3.641 |
| 3477 | 3.641 |
| 3478 | 3.641 |
| 3479 | 3.641 |
| 3480 | 3.641 |
| 3481 | 3.641 |
| 3482 | 3.641 |
| 3483 | 3.641 |
| 3484 | 3.621 |
| 3485 | 3.621 |
| 3486 | 3.621 |
| 3487 | 3.621 |
| 3488 | 3.621 |
| 3489 | 3.621 |
| 3490 | 3.621 |
| 3491 | 3.621 |
| 3492 | 3.621 |
| 3493 | 3.621 |
| 3494 | 3.621 |
| 3495 | 3.621 |
| 3496 | 3.621 |
| 3497 | 3.592 |
| 3498 | 3.592 |
| 3499 | 3.592 |
| 3500 | 3.592 |
| 3501 | 3.592 |
| 3502 | 3.592 |
| 3503 | 3.592 |
| 3504 | 3.592 |
| 3505 | 3.592 |
| 3506 | 3.592 |
| 3507 | 3.592 |
| 3508 | 3.592 |
| 3509 | 3.592 |
| 3510 | 3.592 |
| 3511 | 3.592 |
| 3512 | 3.595 |
| 3513 | 3.595 |
| 3514 | 3.595 |
| 3515 | 3.595 |
| 3516 | 3.595 |
| 3517 | 3.595 |
| 3518 | 3.595 |
| 3519 | 3.595 |
| 3520 | 3.595 |
| 3521 | 3.595 |
| 3522 | 3.595 |
| 3523 | 3.595 |
| 3524 | 3.62 |
| 3525 | 3.62 |
| 3526 | 3.62 |
| 3527 | 3.62 |
| 3528 | 3.62 |
| 3529 | 3.62 |
| 3530 | 3.62 |
| 3531 | 3.62 |
| 3532 | 3.62 |
| 3533 | 3.62 |
| 3534 | 3.62 |
| 3535 | 3.62 |
| 3536 | 3.62 |
| 3537 | 3.62 |
| 3538 | 3.626 |
| 3539 | 3.626 |
| 3540 | 3.626 |
| 3541 | 3.626 |
| 3542 | 3.626 |
| 3543 | 3.626 |
| 3544 | 3.626 |
| 3545 | 3.626 |
| 3546 | 3.626 |
| 3547 | 3.626 |
| 3548 | 3.626 |
| 3549 | 3.626 |
| 3550 | 3.626 |
| 3551 | 3.625 |
| 3552 | 3.625 |
| 3553 | 3.625 |
| 3554 | 3.625 |
| 3555 | 3.625 |
| 3556 | 3.625 |
| 3557 | 3.625 |
| 3558 | 3.625 |
| 3559 | 3.625 |
| 3560 | 3.625 |
| 3561 | 3.625 |
| 3562 | 3.625 |
| 3563 | 3.625 |
| 3564 | 3.625 |
| 3565 | 3.625 |
| 3566 | 3.629 |
| 3567 | 3.629 |
| 3568 | 3.629 |
| 3569 | 3.629 |
| 3570 | 3.629 |
| 3571 | 3.629 |
| 3572 | 3.629 |
| 3573 | 3.629 |
| 3574 | 3.629 |
| 3575 | 3.629 |
| 3576 | 3.629 |
| 3577 | 3.629 |
| 3578 | 3.638 |
| 3579 | 3.638 |
| 3580 | 3.638 |
| 3581 | 3.638 |
| 3582 | 3.638 |
| 3583 | 3.638 |
| 3584 | 3.638 |
| 3585 | 3.638 |
| 3586 | 3.638 |
| 3587 | 3.638 |
| 3588 | 3.638 |
| 3589 | 3.638 |
| 3590 | 3.638 |
| 3591 | 3.638 |
| 3592 | 3.638 |
| 3593 | 3.628 |
| 3594 | 3.628 |
| 3595 | 3.628 |
| 3596 | 3.628 |
| 3597 | 3.628 |
| 3598 | 3.628 |
| 3599 | 3.628 |
| 3600 | 3.628 |
| 3601 | 3.628 |
| 3602 | 3.628 |
| 3603 | 3.628 |
| 3604 | 3.628 |
| 3605 | 3.628 |
| 3606 | 3.628 |
| 3607 | 3.615 |
| 3608 | 3.615 |
| 3609 | 3.615 |
| 3610 | 3.615 |
| 3611 | 3.615 |
| 3612 | 3.615 |
| 3613 | 3.615 |
| 3614 | 3.615 |
| 3615 | 3.615 |
| 3616 | 3.615 |
| 3617 | 3.615 |
| 3618 | 3.615 |
| 3619 | 3.615 |
| 3620 | 3.615 |
| 3621 | 3.623 |
| 3622 | 3.623 |
| 3623 | 3.623 |
| 3624 | 3.623 |
| 3625 | 3.623 |
| 3626 | 3.623 |
| 3627 | 3.623 |
| 3628 | 3.623 |
| 3629 | 3.623 |
| 3630 | 3.623 |
| 3631 | 3.623 |
| 3632 | 3.623 |
| 3633 | 3.623 |
| 3634 | 3.623 |
| 3635 | 3.623 |
| 3636 | 3.623 |
| 3637 | 3.618 |
| 3638 | 3.618 |
| 3639 | 3.618 |
| 3640 | 3.618 |
| 3641 | 3.618 |
| 3642 | 3.618 |
| 3643 | 3.618 |
| 3644 | 3.618 |
| 3645 | 3.618 |
| 3646 | 3.618 |
| 3647 | 3.618 |
| 3648 | 3.614 |
| 3649 | 3.614 |
| 3650 | 3.614 |
| 3651 | 3.614 |
| 3652 | 3.614 |
| 3653 | 3.614 |
| 3654 | 3.614 |
| 3655 | 3.614 |
| 3656 | 3.614 |
| 3657 | 3.614 |
| 3658 | 3.614 |
| 3659 | 3.614 |
| 3660 | 3.614 |
| 3661 | 3.594 |
| 3662 | 3.594 |
| 3663 | 3.594 |
| 3664 | 3.594 |
| 3665 | 3.594 |
| 3666 | 3.594 |
| 3667 | 3.594 |
| 3668 | 3.594 |
| 3669 | 3.594 |
| 3670 | 3.594 |
| 3671 | 3.594 |
| 3672 | 3.594 |
| 3673 | 3.594 |
| 3674 | 3.594 |
| 3675 | 3.594 |
| 3676 | 3.567 |
| 3677 | 3.567 |
| 3678 | 3.567 |
| 3679 | 3.567 |
| 3680 | 3.567 |
| 3681 | 3.567 |
| 3682 | 3.567 |
| 3683 | 3.567 |
| 3684 | 3.567 |
| 3685 | 3.567 |
| 3686 | 3.567 |
| 3687 | 3.582 |
| 3688 | 3.582 |
| 3689 | 3.582 |
| 3690 | 3.582 |
| 3691 | 3.582 |
| 3692 | 3.582 |
| 3693 | 3.582 |
| 3694 | 3.582 |
| 3695 | 3.582 |
| 3696 | 3.582 |
| 3697 | 3.582 |
| 3698 | 3.582 |
| 3699 | 3.589 |
| 3700 | 3.589 |
| 3701 | 3.589 |
| 3702 | 3.589 |
| 3703 | 3.589 |
| 3704 | 3.589 |
| 3705 | 3.589 |
| 3706 | 3.589 |
| 3707 | 3.589 |
| 3708 | 3.589 |
| 3709 | 3.589 |
| 3710 | 3.589 |
| 3711 | 3.589 |
| 3712 | 3.589 |
| 3713 | 3.589 |
| 3714 | 3.562 |
| 3715 | 3.562 |
| 3716 | 3.562 |
| 3717 | 3.562 |
| 3718 | 3.562 |
| 3719 | 3.562 |
| 3720 | 3.562 |
| 3721 | 3.562 |
| 3722 | 3.562 |
| 3723 | 3.562 |
| 3724 | 3.562 |
| 3725 | 3.562 |
| 3726 | 3.562 |
| 3727 | 3.562 |
| 3728 | 3.581 |
| 3729 | 3.581 |
| 3730 | 3.581 |
| 3731 | 3.581 |
| 3732 | 3.581 |
| 3733 | 3.581 |
| 3734 | 3.581 |
| 3735 | 3.581 |
| 3736 | 3.581 |
| 3737 | 3.581 |
| 3738 | 3.581 |
| 3739 | 3.581 |
| 3740 | 3.577 |
| 3741 | 3.577 |
| 3742 | 3.577 |
| 3743 | 3.577 |
| 3744 | 3.577 |
| 3745 | 3.577 |
| 3746 | 3.577 |
| 3747 | 3.577 |
| 3748 | 3.577 |
| 3749 | 3.577 |
| 3750 | 3.577 |
| 3751 | 3.577 |
| 3752 | 3.577 |
| 3753 | 3.577 |
| 3754 | 3.579 |
| 3755 | 3.579 |
| 3756 | 3.579 |
| 3757 | 3.579 |
| 3758 | 3.579 |
| 3759 | 3.579 |
| 3760 | 3.579 |
| 3761 | 3.579 |
| 3762 | 3.579 |
| 3763 | 3.579 |
| 3764 | 3.579 |
| 3765 | 3.579 |
| 3766 | 3.579 |
| 3767 | 3.579 |
| 3768 | 3.589 |
| 3769 | 3.589 |
| 3770 | 3.589 |
| 3771 | 3.589 |
| 3772 | 3.589 |
| 3773 | 3.589 |
| 3774 | 3.589 |
| 3775 | 3.589 |
| 3776 | 3.589 |
| 3777 | 3.589 |
| 3778 | 3.589 |
| 3779 | 3.589 |
| 3780 | 3.62 |
| 3781 | 3.62 |
| 3782 | 3.62 |
| 3783 | 3.62 |
| 3784 | 3.62 |
| 3785 | 3.62 |
| 3786 | 3.62 |
| 3787 | 3.62 |
| 3788 | 3.62 |
| 3789 | 3.62 |
| 3790 | 3.62 |
| 3791 | 3.62 |
| 3792 | 3.607 |
| 3793 | 3.607 |
| 3794 | 3.607 |
| 3795 | 3.607 |
| 3796 | 3.607 |
| 3797 | 3.607 |
| 3798 | 3.607 |
| 3799 | 3.607 |
| 3800 | 3.607 |
| 3801 | 3.607 |
| 3802 | 3.607 |
| 3803 | 3.607 |
| 3804 | 3.607 |
| 3805 | 3.607 |
| 3806 | 3.607 |
| 3807 | 3.58 |
| 3808 | 3.58 |
| 3809 | 3.58 |
| 3810 | 3.58 |
| 3811 | 3.58 |
| 3812 | 3.58 |
| 3813 | 3.58 |
| 3814 | 3.58 |
| 3815 | 3.58 |
| 3816 | 3.58 |
| 3817 | 3.58 |
| 3818 | 3.58 |
| 3819 | 3.58 |
| 3820 | 3.566 |
| 3821 | 3.566 |
| 3822 | 3.566 |
| 3823 | 3.566 |
| 3824 | 3.566 |
| 3825 | 3.566 |
| 3826 | 3.566 |
| 3827 | 3.566 |
| 3828 | 3.566 |
| 3829 | 3.566 |
| 3830 | 3.566 |
| 3831 | 3.566 |
| 3832 | 3.566 |
| 3833 | 3.577 |
| 3834 | 3.577 |
| 3835 | 3.577 |
| 3836 | 3.577 |
| 3837 | 3.577 |
| 3838 | 3.577 |
| 3839 | 3.577 |
| 3840 | 3.577 |
| 3841 | 3.577 |
| 3842 | 3.577 |
| 3843 | 3.577 |
| 3844 | 3.577 |
| 3845 | 3.577 |
| 3846 | 3.577 |
| 3847 | 3.565 |
| 3848 | 3.565 |
| 3849 | 3.565 |
| 3850 | 3.565 |
| 3851 | 3.565 |
| 3852 | 3.565 |
| 3853 | 3.565 |
| 3854 | 3.565 |
| 3855 | 3.565 |
| 3856 | 3.565 |
| 3857 | 3.565 |
| 3858 | 3.565 |
| 3859 | 3.565 |
| 3860 | 3.565 |
| 3861 | 3.576 |
| 3862 | 3.576 |
| 3863 | 3.576 |
| 3864 | 3.576 |
| 3865 | 3.576 |
| 3866 | 3.576 |
| 3867 | 3.576 |
| 3868 | 3.576 |
| 3869 | 3.576 |
| 3870 | 3.576 |
| 3871 | 3.576 |
| 3872 | 3.576 |
| 3873 | 3.576 |
| 3874 | 3.576 |
| 3875 | 3.591 |
| 3876 | 3.591 |
| 3877 | 3.591 |
| 3878 | 3.591 |
| 3879 | 3.591 |
| 3880 | 3.591 |
| 3881 | 3.591 |
| 3882 | 3.591 |
| 3883 | 3.591 |
| 3884 | 3.591 |
| 3885 | 3.591 |
| 3886 | 3.591 |
| 3887 | 3.576 |
| 3888 | 3.576 |
| 3889 | 3.576 |
| 3890 | 3.576 |
| 3891 | 3.576 |
| 3892 | 3.576 |
| 3893 | 3.576 |
| 3894 | 3.576 |
| 3895 | 3.576 |
| 3896 | 3.576 |
| 3897 | 3.576 |
| 3898 | 3.576 |
| 3899 | 3.576 |
| 3900 | 3.576 |
| 3901 | 3.576 |
| 3902 | 3.564 |
| 3903 | 3.564 |
| 3904 | 3.564 |
| 3905 | 3.564 |
| 3906 | 3.564 |
| 3907 | 3.564 |
| 3908 | 3.564 |
| 3909 | 3.564 |
| 3910 | 3.564 |
| 3911 | 3.564 |
| 3912 | 3.564 |
| 3913 | 3.564 |
| 3914 | 3.571 |
| 3915 | 3.571 |
| 3916 | 3.571 |
| 3917 | 3.571 |
| 3918 | 3.571 |
| 3919 | 3.571 |
| 3920 | 3.571 |
| 3921 | 3.571 |
| 3922 | 3.571 |
| 3923 | 3.571 |
| 3924 | 3.571 |
| 3925 | 3.571 |
| 3926 | 3.571 |
| 3927 | 3.571 |
| 3928 | 3.571 |
| 3929 | 3.57 |
| 3930 | 3.57 |
| 3931 | 3.57 |
| 3932 | 3.57 |
| 3933 | 3.57 |
| 3934 | 3.57 |
| 3935 | 3.57 |
| 3936 | 3.57 |
| 3937 | 3.57 |
| 3938 | 3.57 |
| 3939 | 3.57 |
| 3940 | 3.57 |
| 3941 | 3.586 |
| 3942 | 3.586 |
| 3943 | 3.586 |
| 3944 | 3.586 |
| 3945 | 3.586 |
| 3946 | 3.586 |
| 3947 | 3.586 |
| 3948 | 3.586 |
| 3949 | 3.586 |
| 3950 | 3.586 |
| 3951 | 3.586 |
| 3952 | 3.586 |
| 3953 | 3.603 |
| 3954 | 3.603 |
| 3955 | 3.603 |
| 3956 | 3.603 |
| 3957 | 3.603 |
| 3958 | 3.603 |
| 3959 | 3.603 |
| 3960 | 3.603 |
| 3961 | 3.603 |
| 3962 | 3.603 |
| 3963 | 3.603 |
| 3964 | 3.603 |
| 3965 | 3.603 |
| 3966 | 3.603 |
| 3967 | 3.603 |
| 3968 | 3.603 |
| 3969 | 3.581 |
| 3970 | 3.581 |
| 3971 | 3.581 |
| 3972 | 3.581 |
| 3973 | 3.581 |
| 3974 | 3.581 |
| 3975 | 3.581 |
| 3976 | 3.581 |
| 3977 | 3.581 |
| 3978 | 3.581 |
| 3979 | 3.581 |
| 3980 | 3.581 |
| 3981 | 3.581 |
| 3982 | 3.581 |
| 3983 | 3.526 |
| 3984 | 3.526 |
| 3985 | 3.526 |
| 3986 | 3.526 |
| 3987 | 3.526 |
| 3988 | 3.526 |
| 3989 | 3.526 |
| 3990 | 3.526 |
| 3991 | 3.526 |
| 3992 | 3.526 |
| 3993 | 3.526 |
| 3994 | 3.526 |
| 3995 | 3.526 |
| 3996 | 3.526 |
| 3997 | 3.454 |
| 3998 | 3.454 |
| 3999 | 3.454 |
| 4000 | 3.454 |
| 4001 | 3.454 |
| 4002 | 3.454 |
| 4003 | 3.454 |
| 4004 | 3.454 |
| 4005 | 3.454 |
| 4006 | 3.454 |
| 4007 | 3.454 |
| 4008 | 3.454 |
| 4009 | 3.454 |
| 4010 | 3.454 |
| 4011 | 3.474 |
| 4012 | 3.474 |
| 4013 | 3.474 |
| 4014 | 3.474 |
| 4015 | 3.474 |
| 4016 | 3.474 |
| 4017 | 3.474 |
| 4018 | 3.474 |
| 4019 | 3.474 |
| 4020 | 3.474 |
| 4021 | 3.474 |
| 4022 | 3.474 |
| 4023 | 3.521 |
| 4024 | 3.521 |
| 4025 | 3.521 |
| 4026 | 3.521 |
| 4027 | 3.521 |
| 4028 | 3.521 |
| 4029 | 3.521 |
| 4030 | 3.521 |
| 4031 | 3.521 |
| 4032 | 3.521 |
| 4033 | 3.521 |
| 4034 | 3.521 |
| 4035 | 3.558 |
| 4036 | 3.558 |
| 4037 | 3.558 |
| 4038 | 3.558 |
| 4039 | 3.558 |
| 4040 | 3.558 |
| 4041 | 3.558 |
| 4042 | 3.558 |
| 4043 | 3.558 |
| 4044 | 3.558 |
| 4045 | 3.558 |
| 4046 | 3.558 |
| 4047 | 3.558 |
| 4048 | 3.558 |
| 4049 | 3.583 |
| 4050 | 3.583 |
| 4051 | 3.583 |
| 4052 | 3.583 |
| 4053 | 3.583 |
| 4054 | 3.583 |
| 4055 | 3.583 |
| 4056 | 3.583 |
| 4057 | 3.583 |
| 4058 | 3.583 |
| 4059 | 3.583 |
| 4060 | 3.583 |
| 4061 | 3.583 |
| 4062 | 3.548 |
| 4063 | 3.548 |
| 4064 | 3.548 |
| 4065 | 3.548 |
| 4066 | 3.548 |
| 4067 | 3.548 |
| 4068 | 3.548 |
| 4069 | 3.548 |
| 4070 | 3.548 |
| 4071 | 3.548 |
| 4072 | 3.548 |
| 4073 | 3.548 |
| 4074 | 3.548 |
| 4075 | 3.548 |
| 4076 | 3.548 |
| 4077 | 3.529 |
| 4078 | 3.529 |
| 4079 | 3.529 |
| 4080 | 3.529 |
| 4081 | 3.529 |
| 4082 | 3.529 |
| 4083 | 3.529 |
| 4084 | 3.529 |
| 4085 | 3.529 |
| 4086 | 3.529 |
| 4087 | 3.529 |
| 4088 | 3.529 |
| 4089 | 3.525 |
| 4090 | 3.525 |
| 4091 | 3.525 |
| 4092 | 3.525 |
| 4093 | 3.525 |
| 4094 | 3.525 |
| 4095 | 3.525 |
| 4096 | 3.525 |
| 4097 | 3.525 |
| 4098 | 3.525 |
| 4099 | 3.525 |
| 4100 | 3.525 |
| 4101 | 3.528 |
| 4102 | 3.528 |
| 4103 | 3.528 |
| 4104 | 3.528 |
| 4105 | 3.528 |
| 4106 | 3.528 |
| 4107 | 3.528 |
| 4108 | 3.528 |
| 4109 | 3.528 |
| 4110 | 3.528 |
| 4111 | 3.528 |
| 4112 | 3.528 |
| 4113 | 3.528 |
| 4114 | 3.528 |
| 4115 | 3.597 |
| 4116 | 3.597 |
| 4117 | 3.597 |
| 4118 | 3.597 |
| 4119 | 3.597 |
| 4120 | 3.597 |
| 4121 | 3.597 |
| 4122 | 3.597 |
| 4123 | 3.597 |
| 4124 | 3.597 |
| 4125 | 3.597 |
| 4126 | 3.597 |
| 4127 | 3.597 |
| 4128 | 3.597 |
| 4129 | 3.597 |
| 4130 | 3.647 |
| 4131 | 3.647 |
| 4132 | 3.647 |
| 4133 | 3.647 |
| 4134 | 3.647 |
| 4135 | 3.647 |
| 4136 | 3.647 |
| 4137 | 3.647 |
| 4138 | 3.647 |
| 4139 | 3.647 |
| 4140 | 3.647 |
| 4141 | 3.647 |
| 4142 | 3.647 |
| 4143 | 3.637 |
| 4144 | 3.637 |
| 4145 | 3.637 |
| 4146 | 3.637 |
| 4147 | 3.637 |
| 4148 | 3.637 |
| 4149 | 3.637 |
| 4150 | 3.637 |
| 4151 | 3.637 |
| 4152 | 3.637 |
| 4153 | 3.637 |
| 4154 | 3.637 |
| 4155 | 3.637 |
| 4156 | 3.637 |
| 4157 | 3.637 |
| 4158 | 3.62 |
| 4159 | 3.62 |
| 4160 | 3.62 |
| 4161 | 3.62 |
| 4162 | 3.62 |
| 4163 | 3.62 |
| 4164 | 3.62 |
| 4165 | 3.62 |
| 4166 | 3.62 |
| 4167 | 3.62 |
| 4168 | 3.62 |
| 4169 | 3.62 |
| 4170 | 3.644 |
| 4171 | 3.644 |
| 4172 | 3.644 |
| 4173 | 3.644 |
| 4174 | 3.644 |
| 4175 | 3.644 |
| 4176 | 3.644 |
| 4177 | 3.644 |
| 4178 | 3.644 |
| 4179 | 3.644 |
| 4180 | 3.644 |
| 4181 | 3.644 |
| 4182 | 3.644 |
| 4183 | 3.648 |
| 4184 | 3.648 |
| 4185 | 3.648 |
| 4186 | 3.648 |
| 4187 | 3.648 |
| 4188 | 3.648 |
| 4189 | 3.648 |
| 4190 | 3.648 |
| 4191 | 3.648 |
| 4192 | 3.648 |
| 4193 | 3.648 |
| 4194 | 3.648 |
| 4195 | 3.648 |
| 4196 | 3.648 |
| 4197 | 3.648 |
| 4198 | 3.65 |
| 4199 | 3.65 |
| 4200 | 3.65 |
| 4201 | 3.65 |
| 4202 | 3.65 |
| 4203 | 3.65 |
| 4204 | 3.65 |
| 4205 | 3.65 |
| 4206 | 3.65 |
| 4207 | 3.65 |
| 4208 | 3.65 |
| 4209 | 3.65 |
| 4210 | 3.642 |
| 4211 | 3.642 |
| 4212 | 3.642 |
| 4213 | 3.642 |
| 4214 | 3.642 |
| 4215 | 3.642 |
| 4216 | 3.642 |
| 4217 | 3.642 |
| 4218 | 3.642 |
| 4219 | 3.642 |
| 4220 | 3.642 |
| 4221 | 3.668 |
| 4222 | 3.668 |
| 4223 | 3.668 |
| 4224 | 3.668 |
| 4225 | 3.668 |
| 4226 | 3.668 |
| 4227 | 3.668 |
| 4228 | 3.668 |
| 4229 | 3.668 |
| 4230 | 3.668 |
| 4231 | 3.668 |
| 4232 | 3.668 |
| 4233 | 3.668 |
| 4234 | 3.668 |
| 4235 | 3.64 |
| 4236 | 3.64 |
| 4237 | 3.64 |
| 4238 | 3.64 |
| 4239 | 3.64 |
| 4240 | 3.64 |
| 4241 | 3.64 |
| 4242 | 3.64 |
| 4243 | 3.64 |
| 4244 | 3.64 |
| 4245 | 3.64 |
| 4246 | 3.64 |
| 4247 | 3.618 |
| 4248 | 3.618 |
| 4249 | 3.618 |
| 4250 | 3.618 |
| 4251 | 3.618 |
| 4252 | 3.618 |
| 4253 | 3.618 |
| 4254 | 3.618 |
| 4255 | 3.618 |
| 4256 | 3.618 |
| 4257 | 3.618 |
| 4258 | 3.618 |
| 4259 | 3.618 |
| 4260 | 3.618 |
| 4261 | 3.618 |
| 4262 | 3.616 |
| 4263 | 3.616 |
| 4264 | 3.616 |
| 4265 | 3.616 |
| 4266 | 3.616 |
| 4267 | 3.616 |
| 4268 | 3.616 |
| 4269 | 3.616 |
| 4270 | 3.616 |
| 4271 | 3.616 |
| 4272 | 3.616 |
| 4273 | 3.616 |
| 4274 | 3.616 |
| 4275 | 3.616 |
| 4276 | 3.633 |
| 4277 | 3.633 |
| 4278 | 3.633 |
| 4279 | 3.633 |
| 4280 | 3.633 |
| 4281 | 3.633 |
| 4282 | 3.633 |
| 4283 | 3.633 |
| 4284 | 3.633 |
| 4285 | 3.633 |
| 4286 | 3.633 |
| 4287 | 3.633 |
| 4288 | 3.649 |
| 4289 | 3.649 |
| 4290 | 3.649 |
| 4291 | 3.649 |
| 4292 | 3.649 |
| 4293 | 3.649 |
| 4294 | 3.649 |
| 4295 | 3.649 |
| 4296 | 3.649 |
| 4297 | 3.649 |
| 4298 | 3.649 |
| 4299 | 3.649 |
| 4300 | 3.649 |
| 4301 | 3.649 |
| 4302 | 3.65 |
| 4303 | 3.65 |
| 4304 | 3.65 |
| 4305 | 3.65 |
| 4306 | 3.65 |
| 4307 | 3.65 |
| 4308 | 3.65 |
| 4309 | 3.65 |
| 4310 | 3.65 |
| 4311 | 3.65 |
| 4312 | 3.65 |
| 4313 | 3.65 |
| 4314 | 3.65 |
| 4315 | 3.65 |
| 4316 | 3.65 |
| 4317 | 3.65 |
| 4318 | 3.65 |
| 4319 | 3.65 |
| 4320 | 3.65 |
| 4321 | 3.65 |
| 4322 | 3.65 |
| 4323 | 3.65 |
| 4324 | 3.65 |
| 4325 | 3.65 |
| 4326 | 3.65 |
| 4327 | 3.65 |
| 4328 | 3.651 |
| 4329 | 3.651 |
| 4330 | 3.651 |
| 4331 | 3.651 |
| 4332 | 3.651 |
| 4333 | 3.651 |
| 4334 | 3.651 |
| 4335 | 3.651 |
| 4336 | 3.651 |
| 4337 | 3.651 |
| 4338 | 3.651 |
| 4339 | 3.651 |
| 4340 | 3.651 |
| 4341 | 3.651 |
| 4342 | 3.651 |
| 4343 | 3.634 |
| 4344 | 3.634 |
| 4345 | 3.634 |
| 4346 | 3.634 |
| 4347 | 3.634 |
| 4348 | 3.634 |
| 4349 | 3.634 |
| 4350 | 3.634 |
| 4351 | 3.634 |
| 4352 | 3.634 |
| 4353 | 3.634 |
| 4354 | 3.634 |
| 4355 | 3.634 |
| 4356 | 3.604 |
| 4357 | 3.604 |
| 4358 | 3.604 |
| 4359 | 3.604 |
| 4360 | 3.604 |
| 4361 | 3.604 |
| 4362 | 3.604 |
| 4363 | 3.604 |
| 4364 | 3.604 |
| 4365 | 3.604 |
| 4366 | 3.604 |
| 4367 | 3.604 |
| 4368 | 3.604 |
| 4369 | 3.604 |
| 4370 | 3.604 |
| 4371 | 3.604 |
| 4372 | 3.604 |
| 4373 | 3.604 |
| 4374 | 3.604 |
| 4375 | 3.604 |
| 4376 | 3.604 |
| 4377 | 3.604 |
| 4378 | 3.604 |
| 4379 | 3.604 |
| 4380 | 3.604 |
| 4381 | 3.604 |
| 4382 | 3.604 |
| 4383 | 3.57 |
| 4384 | 3.57 |
| 4385 | 3.57 |
| 4386 | 3.57 |
| 4387 | 3.57 |
| 4388 | 3.57 |
| 4389 | 3.57 |
| 4390 | 3.57 |
| 4391 | 3.57 |
| 4392 | 3.57 |
| 4393 | 3.57 |
| 4394 | 3.57 |
| 4395 | 3.57 |
| 4396 | 3.57 |
| 4397 | 3.541 |
| 4398 | 3.541 |
| 4399 | 3.541 |
| 4400 | 3.541 |
| 4401 | 3.541 |
| 4402 | 3.541 |
| 4403 | 3.541 |
| 4404 | 3.541 |
| 4405 | 3.541 |
| 4406 | 3.541 |
| 4407 | 3.541 |
| 4408 | 3.541 |
| 4409 | 3.541 |
| 4410 | 3.548 |
| 4411 | 3.548 |
| 4412 | 3.548 |
| 4413 | 3.548 |
| 4414 | 3.548 |
| 4415 | 3.548 |
| 4416 | 3.548 |
| 4417 | 3.548 |
| 4418 | 3.548 |
| 4419 | 3.548 |
| 4420 | 3.548 |
| 4421 | 3.548 |
| 4422 | 3.548 |
| 4423 | 3.548 |
| 4424 | 3.56 |
| 4425 | 3.56 |
| 4426 | 3.56 |
| 4427 | 3.56 |
| 4428 | 3.56 |
| 4429 | 3.56 |
| 4430 | 3.56 |
| 4431 | 3.56 |
| 4432 | 3.56 |
| 4433 | 3.56 |
| 4434 | 3.56 |
| 4435 | 3.56 |
| 4436 | 3.56 |
| 4437 | 3.576 |
| 4438 | 3.576 |
| 4439 | 3.576 |
| 4440 | 3.576 |
| 4441 | 3.576 |
| 4442 | 3.576 |
| 4443 | 3.576 |
| 4444 | 3.576 |
| 4445 | 3.576 |
| 4446 | 3.576 |
| 4447 | 3.576 |
| 4448 | 3.576 |
| 4449 | 3.576 |
| 4450 | 3.564 |
| 4451 | 3.564 |
| 4452 | 3.564 |
| 4453 | 3.564 |
| 4454 | 3.564 |
| 4455 | 3.564 |
| 4456 | 3.564 |
| 4457 | 3.564 |
| 4458 | 3.564 |
| 4459 | 3.564 |
| 4460 | 3.564 |
| 4461 | 3.564 |
| 4462 | 3.564 |
| 4463 | 3.564 |
| 4464 | 3.564 |
| 4465 | 3.565 |
| 4466 | 3.565 |
| 4467 | 3.565 |
| 4468 | 3.565 |
| 4469 | 3.565 |
| 4470 | 3.565 |
| 4471 | 3.565 |
| 4472 | 3.565 |
| 4473 | 3.565 |
| 4474 | 3.565 |
| 4475 | 3.565 |
| 4476 | 3.565 |
| 4477 | 3.605 |
| 4478 | 3.605 |
| 4479 | 3.605 |
| 4480 | 3.605 |
| 4481 | 3.605 |
| 4482 | 3.605 |
| 4483 | 3.605 |
| 4484 | 3.605 |
| 4485 | 3.605 |
| 4486 | 3.605 |
| 4487 | 3.605 |
| 4488 | 3.605 |
| 4489 | 3.605 |
| 4490 | 3.605 |
| 4491 | 3.634 |
| 4492 | 3.634 |
| 4493 | 3.634 |
| 4494 | 3.634 |
| 4495 | 3.634 |
| 4496 | 3.634 |
| 4497 | 3.634 |
| 4498 | 3.634 |
| 4499 | 3.634 |
| 4500 | 3.634 |
| 4501 | 3.634 |
| 4502 | 3.634 |
| 4503 | 3.634 |
| 4504 | 3.634 |
| 4505 | 3.637 |
| 4506 | 3.637 |
| 4507 | 3.637 |
| 4508 | 3.637 |
| 4509 | 3.637 |
| 4510 | 3.637 |
| 4511 | 3.637 |
| 4512 | 3.637 |
| 4513 | 3.637 |
| 4514 | 3.637 |
| 4515 | 3.637 |
| 4516 | 3.637 |
| 4517 | 3.67 |
| 4518 | 3.67 |
| 4519 | 3.67 |
| 4520 | 3.67 |
| 4521 | 3.67 |
| 4522 | 3.67 |
| 4523 | 3.67 |
| 4524 | 3.67 |
| 4525 | 3.67 |
| 4526 | 3.67 |
| 4527 | 3.67 |
| 4528 | 3.67 |
| 4529 | 3.67 |
| 4530 | 3.67 |
| 4531 | 3.664 |
| 4532 | 3.664 |
| 4533 | 3.664 |
| 4534 | 3.664 |
| 4535 | 3.664 |
| 4536 | 3.664 |
| 4537 | 3.664 |
| 4538 | 3.664 |
| 4539 | 3.664 |
| 4540 | 3.664 |
| 4541 | 3.664 |
| 4542 | 3.664 |
| 4543 | 3.664 |
| 4544 | 3.664 |
| 4545 | 3.664 |
| 4546 | 3.65 |
| 4547 | 3.65 |
| 4548 | 3.65 |
| 4549 | 3.65 |
| 4550 | 3.65 |
| 4551 | 3.65 |
| 4552 | 3.65 |
| 4553 | 3.65 |
| 4554 | 3.65 |
| 4555 | 3.65 |
| 4556 | 3.65 |
| 4557 | 3.621 |
| 4558 | 3.621 |
| 4559 | 3.621 |
| 4560 | 3.621 |
| 4561 | 3.621 |
| 4562 | 3.621 |
| 4563 | 3.621 |
| 4564 | 3.621 |
| 4565 | 3.621 |
| 4566 | 3.621 |
| 4567 | 3.621 |
| 4568 | 3.621 |
| 4569 | 3.621 |
| 4570 | 3.621 |
| 4571 | 3.621 |
| 4572 | 3.587 |
| 4573 | 3.587 |
| 4574 | 3.587 |
| 4575 | 3.587 |
| 4576 | 3.587 |
| 4577 | 3.587 |
| 4578 | 3.587 |
| 4579 | 3.587 |
| 4580 | 3.587 |
| 4581 | 3.587 |
| 4582 | 3.587 |
| 4583 | 3.587 |
| 4584 | 3.587 |
| 4585 | 3.587 |
| 4586 | 3.605 |
| 4587 | 3.605 |
| 4588 | 3.605 |
| 4589 | 3.605 |
| 4590 | 3.605 |
| 4591 | 3.605 |
| 4592 | 3.605 |
| 4593 | 3.605 |
| 4594 | 3.605 |
| 4595 | 3.605 |
| 4596 | 3.605 |
| 4597 | 3.605 |
| 4598 | 3.605 |
| 4599 | 3.547 |
| 4600 | 3.547 |
| 4601 | 3.547 |
| 4602 | 3.547 |
| 4603 | 3.547 |
| 4604 | 3.547 |
| 4605 | 3.547 |
| 4606 | 3.547 |
| 4607 | 3.547 |
| 4608 | 3.547 |
| 4609 | 3.547 |
| 4610 | 3.547 |
| 4611 | 3.547 |
| 4612 | 3.547 |
| 4613 | 3.534 |
| 4614 | 3.534 |
| 4615 | 3.534 |
| 4616 | 3.534 |
| 4617 | 3.534 |
| 4618 | 3.534 |
| 4619 | 3.534 |
| 4620 | 3.534 |
| 4621 | 3.534 |
| 4622 | 3.534 |
| 4623 | 3.534 |
| 4624 | 3.534 |
| 4625 | 3.567 |
| 4626 | 3.567 |
| 4627 | 3.567 |
| 4628 | 3.567 |
| 4629 | 3.567 |
| 4630 | 3.567 |
| 4631 | 3.567 |
| 4632 | 3.567 |
| 4633 | 3.567 |
| 4634 | 3.567 |
| 4635 | 3.567 |
| 4636 | 3.567 |
| 4637 | 3.567 |
| 4638 | 3.567 |
| 4639 | 3.578 |
| 4640 | 3.578 |
| 4641 | 3.578 |
| 4642 | 3.578 |
| 4643 | 3.578 |
| 4644 | 3.578 |
| 4645 | 3.578 |
| 4646 | 3.578 |
| 4647 | 3.578 |
| 4648 | 3.578 |
| 4649 | 3.578 |
| 4650 | 3.578 |
| 4651 | 3.551 |
| 4652 | 3.551 |
| 4653 | 3.551 |
| 4654 | 3.551 |
| 4655 | 3.551 |
| 4656 | 3.551 |
| 4657 | 3.551 |
| 4658 | 3.551 |
| 4659 | 3.551 |
| 4660 | 3.551 |
| 4661 | 3.551 |
| 4662 | 3.551 |
| 4663 | 3.551 |
| 4664 | 3.536 |
| 4665 | 3.536 |
| 4666 | 3.536 |
| 4667 | 3.536 |
| 4668 | 3.536 |
| 4669 | 3.536 |
| 4670 | 3.536 |
| 4671 | 3.536 |
| 4672 | 3.536 |
| 4673 | 3.536 |
| 4674 | 3.536 |
| 4675 | 3.536 |
| 4676 | 3.536 |
| 4677 | 3.539 |
| 4678 | 3.539 |
| 4679 | 3.539 |
| 4680 | 3.539 |
| 4681 | 3.539 |
| 4682 | 3.539 |
| 4683 | 3.539 |
| 4684 | 3.539 |
| 4685 | 3.539 |
| 4686 | 3.539 |
| 4687 | 3.539 |
| 4688 | 3.539 |
| 4689 | 3.539 |
| 4690 | 3.576 |
| 4691 | 3.576 |
| 4692 | 3.576 |
| 4693 | 3.576 |
| 4694 | 3.576 |
| 4695 | 3.576 |
| 4696 | 3.576 |
| 4697 | 3.576 |
| 4698 | 3.576 |
| 4699 | 3.576 |
| 4700 | 3.576 |
| 4701 | 3.576 |
| 4702 | 3.576 |
| 4703 | 3.548 |
| 4704 | 3.548 |
| 4705 | 3.548 |
| 4706 | 3.548 |
| 4707 | 3.548 |
| 4708 | 3.548 |
| 4709 | 3.548 |
| 4710 | 3.548 |
| 4711 | 3.548 |
| 4712 | 3.548 |
| 4713 | 3.548 |
| 4714 | 3.548 |
| 4715 | 3.548 |
| 4716 | 3.531 |
| 4717 | 3.531 |
| 4718 | 3.531 |
| 4719 | 3.531 |
| 4720 | 3.531 |
| 4721 | 3.531 |
| 4722 | 3.531 |
| 4723 | 3.531 |
| 4724 | 3.531 |
| 4725 | 3.531 |
| 4726 | 3.531 |
| 4727 | 3.531 |
| 4728 | 3.531 |
| 4729 | 3.531 |
| 4730 | 3.547 |
| 4731 | 3.547 |
| 4732 | 3.547 |
| 4733 | 3.547 |
| 4734 | 3.547 |
| 4735 | 3.547 |
| 4736 | 3.547 |
| 4737 | 3.547 |
| 4738 | 3.547 |
| 4739 | 3.547 |
| 4740 | 3.547 |
| 4741 | 3.547 |
| 4742 | 3.547 |
| 4743 | 3.547 |
| 4744 | 3.547 |
| 4745 | 3.572 |
| 4746 | 3.572 |
| 4747 | 3.572 |
| 4748 | 3.572 |
| 4749 | 3.572 |
| 4750 | 3.572 |
| 4751 | 3.572 |
| 4752 | 3.572 |
| 4753 | 3.572 |
| 4754 | 3.572 |
| 4755 | 3.572 |
| 4756 | 3.572 |
| 4757 | 3.572 |
| 4758 | 3.594 |
| 4759 | 3.594 |
| 4760 | 3.594 |
| 4761 | 3.594 |
| 4762 | 3.594 |
| 4763 | 3.594 |
| 4764 | 3.594 |
| 4765 | 3.594 |
| 4766 | 3.594 |
| 4767 | 3.594 |
| 4768 | 3.594 |
| 4769 | 3.594 |
| 4770 | 3.594 |
| 4771 | 3.594 |
| 4772 | 3.585 |
| 4773 | 3.585 |
| 4774 | 3.585 |
| 4775 | 3.585 |
| 4776 | 3.585 |
| 4777 | 3.585 |
| 4778 | 3.585 |
| 4779 | 3.585 |
| 4780 | 3.585 |
| 4781 | 3.585 |
| 4782 | 3.585 |
| 4783 | 3.585 |
| 4784 | 3.571 |
| 4785 | 3.571 |
| 4786 | 3.571 |
| 4787 | 3.571 |
| 4788 | 3.571 |
| 4789 | 3.571 |
| 4790 | 3.571 |
| 4791 | 3.571 |
| 4792 | 3.571 |
| 4793 | 3.571 |
| 4794 | 3.571 |
| 4795 | 3.571 |
| 4796 | 3.571 |
| 4797 | 3.571 |
| 4798 | 3.571 |
| 4799 | 3.571 |
| 4800 | 3.571 |
| 4801 | 3.571 |
| 4802 | 3.571 |
| 4803 | 3.571 |
| 4804 | 3.571 |
| 4805 | 3.571 |
| 4806 | 3.571 |
| 4807 | 3.571 |
| 4808 | 3.571 |
| 4809 | 3.571 |
| 4810 | 3.571 |
| 4811 | 3.571 |
| 4812 | 3.578 |
| 4813 | 3.578 |
| 4814 | 3.578 |
| 4815 | 3.578 |
| 4816 | 3.578 |
| 4817 | 3.578 |
| 4818 | 3.578 |
| 4819 | 3.578 |
| 4820 | 3.578 |
| 4821 | 3.578 |
| 4822 | 3.578 |
| 4823 | 3.578 |
| 4824 | 3.578 |
| 4825 | 3.578 |
| 4826 | 3.578 |
| 4827 | 3.592 |
| 4828 | 3.592 |
| 4829 | 3.592 |
| 4830 | 3.592 |
| 4831 | 3.592 |
| 4832 | 3.592 |
| 4833 | 3.592 |
| 4834 | 3.592 |
| 4835 | 3.592 |
| 4836 | 3.592 |
| 4837 | 3.592 |
| 4838 | 3.592 |
| 4839 | 3.593 |
| 4840 | 3.593 |
| 4841 | 3.593 |
| 4842 | 3.593 |
| 4843 | 3.593 |
| 4844 | 3.593 |
| 4845 | 3.593 |
| 4846 | 3.593 |
| 4847 | 3.593 |
| 4848 | 3.593 |
| 4849 | 3.593 |
| 4850 | 3.593 |
| 4851 | 3.593 |
| 4852 | 3.593 |
| 4853 | 3.578 |
| 4854 | 3.578 |
| 4855 | 3.578 |
| 4856 | 3.578 |
| 4857 | 3.578 |
| 4858 | 3.578 |
| 4859 | 3.578 |
| 4860 | 3.578 |
| 4861 | 3.578 |
| 4862 | 3.578 |
| 4863 | 3.578 |
| 4864 | 3.578 |
| 4865 | 3.578 |
| 4866 | 3.578 |
| 4867 | 3.559 |
| 4868 | 3.559 |
| 4869 | 3.559 |
| 4870 | 3.559 |
| 4871 | 3.559 |
| 4872 | 3.559 |
| 4873 | 3.559 |
| 4874 | 3.559 |
| 4875 | 3.559 |
| 4876 | 3.559 |
| 4877 | 3.559 |
| 4878 | 3.559 |
| 4879 | 3.559 |
| 4880 | 3.559 |
| 4881 | 3.563 |
| 4882 | 3.563 |
| 4883 | 3.563 |
| 4884 | 3.563 |
| 4885 | 3.563 |
| 4886 | 3.563 |
| 4887 | 3.563 |
| 4888 | 3.563 |
| 4889 | 3.563 |
| 4890 | 3.563 |
| 4891 | 3.563 |
| 4892 | 3.563 |
| 4893 | 3.574 |
| 4894 | 3.574 |
| 4895 | 3.574 |
| 4896 | 3.574 |
| 4897 | 3.574 |
| 4898 | 3.574 |
| 4899 | 3.574 |
| 4900 | 3.574 |
| 4901 | 3.574 |
| 4902 | 3.574 |
| 4903 | 3.574 |
| 4904 | 3.574 |
| 4905 | 3.574 |
| 4906 | 3.574 |
| 4907 | 3.574 |
| 4908 | 3.618 |
| 4909 | 3.618 |
| 4910 | 3.618 |
| 4911 | 3.618 |
| 4912 | 3.618 |
| 4913 | 3.618 |
| 4914 | 3.618 |
| 4915 | 3.618 |
| 4916 | 3.618 |
| 4917 | 3.618 |
| 4918 | 3.618 |
| 4919 | 3.618 |
| 4920 | 3.618 |
| 4921 | 3.618 |
| 4922 | 3.666 |
| 4923 | 3.666 |
| 4924 | 3.666 |
| 4925 | 3.666 |
| 4926 | 3.666 |
| 4927 | 3.666 |
| 4928 | 3.666 |
| 4929 | 3.666 |
| 4930 | 3.666 |
| 4931 | 3.666 |
| 4932 | 3.666 |
| 4933 | 3.666 |
| 4934 | 3.626 |
| 4935 | 3.626 |
| 4936 | 3.626 |
| 4937 | 3.626 |
| 4938 | 3.626 |
| 4939 | 3.626 |
| 4940 | 3.626 |
| 4941 | 3.626 |
| 4942 | 3.626 |
| 4943 | 3.626 |
| 4944 | 3.626 |
| 4945 | 3.626 |
| 4946 | 3.626 |
| 4947 | 3.626 |
| 4948 | 3.626 |
| 4949 | 3.654 |
| 4950 | 3.654 |
| 4951 | 3.654 |
| 4952 | 3.654 |
| 4953 | 3.654 |
| 4954 | 3.654 |
| 4955 | 3.654 |
| 4956 | 3.654 |
| 4957 | 3.654 |
| 4958 | 3.654 |
| 4959 | 3.654 |
| 4960 | 3.654 |
| 4961 | 3.692 |
| 4962 | 3.692 |
| 4963 | 3.692 |
| 4964 | 3.692 |
| 4965 | 3.692 |
| 4966 | 3.692 |
| 4967 | 3.692 |
| 4968 | 3.692 |
| 4969 | 3.692 |
| 4970 | 3.692 |
| 4971 | 3.692 |
| 4972 | 3.692 |
| 4973 | 3.692 |
| 4974 | 3.697 |
| 4975 | 3.697 |
| 4976 | 3.697 |
| 4977 | 3.697 |
| 4978 | 3.697 |
| 4979 | 3.697 |
| 4980 | 3.697 |
| 4981 | 3.697 |
| 4982 | 3.697 |
| 4983 | 3.697 |
| 4984 | 3.697 |
| 4985 | 3.697 |
| 4986 | 3.697 |
| 4987 | 3.697 |
| 4988 | 3.697 |
| 4989 | 3.697 |
| 4990 | 3.707 |
| 4991 | 3.707 |
| 4992 | 3.707 |
| 4993 | 3.707 |
| 4994 | 3.707 |
| 4995 | 3.707 |
| 4996 | 3.707 |
| 4997 | 3.707 |
| 4998 | 3.707 |
| 4999 | 3.707 |
| 5000 | 3.707 |
| 5001 | 3.707 |
| 5002 | 3.707 |
| 5003 | 3.719 |
| 5004 | 3.719 |
| 5005 | 3.719 |
| 5006 | 3.719 |
| 5007 | 3.719 |
| 5008 | 3.719 |
| 5009 | 3.719 |
| 5010 | 3.719 |
| 5011 | 3.719 |
| 5012 | 3.719 |
| 5013 | 3.719 |
| 5014 | 3.719 |
| 5015 | 3.72 |
| 5016 | 3.72 |
| 5017 | 3.72 |
| 5018 | 3.72 |
| 5019 | 3.72 |
| 5020 | 3.72 |
| 5021 | 3.72 |
| 5022 | 3.72 |
| 5023 | 3.72 |
| 5024 | 3.72 |
| 5025 | 3.72 |
| 5026 | 3.72 |
| 5027 | 3.72 |
| 5028 | 3.72 |
| 5029 | 3.72 |
| 5030 | 3.721 |
| 5031 | 3.721 |
| 5032 | 3.721 |
| 5033 | 3.721 |
| 5034 | 3.721 |
| 5035 | 3.721 |
| 5036 | 3.721 |
| 5037 | 3.721 |
| 5038 | 3.721 |
| 5039 | 3.721 |
| 5040 | 3.721 |
| 5041 | 3.721 |
| 5042 | 3.721 |
| 5043 | 3.698 |
| 5044 | 3.698 |
| 5045 | 3.698 |
| 5046 | 3.698 |
| 5047 | 3.698 |
| 5048 | 3.698 |
| 5049 | 3.698 |
| 5050 | 3.698 |
| 5051 | 3.698 |
| 5052 | 3.698 |
| 5053 | 3.698 |
| 5054 | 3.698 |
| 5055 | 3.698 |
| 5056 | 3.698 |
| 5057 | 3.698 |
| 5058 | 3.698 |
| 5059 | 3.664 |
| 5060 | 3.664 |
| 5061 | 3.664 |
| 5062 | 3.664 |
| 5063 | 3.664 |
| 5064 | 3.664 |
| 5065 | 3.664 |
| 5066 | 3.664 |
| 5067 | 3.664 |
| 5068 | 3.664 |
| 5069 | 3.664 |
| 5070 | 3.664 |
| 5071 | 3.662 |
| 5072 | 3.662 |
| 5073 | 3.662 |
| 5074 | 3.662 |
| 5075 | 3.662 |
| 5076 | 3.662 |
| 5077 | 3.662 |
| 5078 | 3.662 |
| 5079 | 3.662 |
| 5080 | 3.662 |
| 5081 | 3.662 |
| 5082 | 3.662 |
| 5083 | 3.662 |
| 5084 | 3.662 |
| 5085 | 3.662 |
| 5086 | 3.684 |
| 5087 | 3.684 |
| 5088 | 3.684 |
| 5089 | 3.684 |
| 5090 | 3.684 |
| 5091 | 3.684 |
| 5092 | 3.684 |
| 5093 | 3.684 |
| 5094 | 3.684 |
| 5095 | 3.684 |
| 5096 | 3.684 |
| 5097 | 3.684 |
| 5098 | 3.691 |
| 5099 | 3.691 |
| 5100 | 3.691 |
| 5101 | 3.691 |
| 5102 | 3.691 |
| 5103 | 3.691 |
| 5104 | 3.691 |
| 5105 | 3.691 |
| 5106 | 3.691 |
| 5107 | 3.691 |
| 5108 | 3.691 |
| 5109 | 3.691 |
| 5110 | 3.677 |
| 5111 | 3.677 |
| 5112 | 3.677 |
| 5113 | 3.677 |
| 5114 | 3.677 |
| 5115 | 3.677 |
| 5116 | 3.677 |
| 5117 | 3.677 |
| 5118 | 3.677 |
| 5119 | 3.677 |
| 5120 | 3.677 |
| 5121 | 3.677 |
| 5122 | 3.677 |
| 5123 | 3.677 |
| 5124 | 3.676 |
| 5125 | 3.676 |
| 5126 | 3.676 |
| 5127 | 3.676 |
| 5128 | 3.676 |
| 5129 | 3.676 |
| 5130 | 3.676 |
| 5131 | 3.676 |
| 5132 | 3.676 |
| 5133 | 3.676 |
| 5134 | 3.676 |
| 5135 | 3.676 |
| 5136 | 3.676 |
| 5137 | 3.676 |
| 5138 | 3.672 |
| 5139 | 3.672 |
| 5140 | 3.672 |
| 5141 | 3.672 |
| 5142 | 3.672 |
| 5143 | 3.672 |
| 5144 | 3.672 |
| 5145 | 3.672 |
| 5146 | 3.672 |
| 5147 | 3.672 |
| 5148 | 3.672 |
| 5149 | 3.672 |
| 5150 | 3.671 |
| 5151 | 3.671 |
| 5152 | 3.671 |
| 5153 | 3.671 |
| 5154 | 3.671 |
| 5155 | 3.671 |
| 5156 | 3.671 |
| 5157 | 3.671 |
| 5158 | 3.671 |
| 5159 | 3.671 |
| 5160 | 3.671 |
| 5161 | 3.671 |
| 5162 | 3.671 |
| 5163 | 3.671 |
| 5164 | 3.689 |
| 5165 | 3.689 |
| 5166 | 3.689 |
| 5167 | 3.689 |
| 5168 | 3.689 |
| 5169 | 3.689 |
| 5170 | 3.689 |
| 5171 | 3.689 |
| 5172 | 3.689 |
| 5173 | 3.689 |
| 5174 | 3.689 |
| 5175 | 3.689 |
| 5176 | 3.701 |
| 5177 | 3.701 |
| 5178 | 3.701 |
| 5179 | 3.701 |
| 5180 | 3.701 |
| 5181 | 3.701 |
| 5182 | 3.701 |
| 5183 | 3.701 |
| 5184 | 3.701 |
| 5185 | 3.701 |
| 5186 | 3.701 |
| 5187 | 3.701 |
| 5188 | 3.701 |
| 5189 | 3.701 |
| 5190 | 3.701 |
| 5191 | 3.716 |
| 5192 | 3.716 |
| 5193 | 3.716 |
| 5194 | 3.716 |
| 5195 | 3.716 |
| 5196 | 3.716 |
| 5197 | 3.716 |
| 5198 | 3.716 |
| 5199 | 3.716 |
| 5200 | 3.716 |
| 5201 | 3.716 |
| 5202 | 3.716 |
| 5203 | 3.716 |
| 5204 | 3.716 |
| 5205 | 3.701 |
| 5206 | 3.701 |
| 5207 | 3.701 |
| 5208 | 3.701 |
| 5209 | 3.701 |
| 5210 | 3.701 |
| 5211 | 3.701 |
| 5212 | 3.701 |
| 5213 | 3.701 |
| 5214 | 3.701 |
| 5215 | 3.701 |
| 5216 | 3.673 |
| 5217 | 3.673 |
| 5218 | 3.673 |
| 5219 | 3.673 |
| 5220 | 3.673 |
| 5221 | 3.673 |
| 5222 | 3.673 |
| 5223 | 3.673 |
| 5224 | 3.673 |
| 5225 | 3.673 |
| 5226 | 3.673 |
| 5227 | 3.673 |
| 5228 | 3.647 |
| 5229 | 3.647 |
| 5230 | 3.647 |
| 5231 | 3.647 |
| 5232 | 3.647 |
| 5233 | 3.647 |
| 5234 | 3.647 |
| 5235 | 3.647 |
| 5236 | 3.647 |
| 5237 | 3.647 |
| 5238 | 3.647 |
| 5239 | 3.647 |
| 5240 | 3.647 |
| 5241 | 3.647 |
| 5242 | 3.647 |
| 5243 | 3.627 |
| 5244 | 3.627 |
| 5245 | 3.627 |
| 5246 | 3.627 |
| 5247 | 3.627 |
| 5248 | 3.627 |
| 5249 | 3.627 |
| 5250 | 3.627 |
| 5251 | 3.627 |
| 5252 | 3.627 |
| 5253 | 3.627 |
| 5254 | 3.627 |
| 5255 | 3.627 |
| 5256 | 3.627 |
| 5257 | 3.624 |
| 5258 | 3.624 |
| 5259 | 3.624 |
| 5260 | 3.624 |
| 5261 | 3.624 |
| 5262 | 3.624 |
| 5263 | 3.624 |
| 5264 | 3.624 |
| 5265 | 3.624 |
| 5266 | 3.624 |
| 5267 | 3.624 |
| 5268 | 3.624 |
| 5269 | 3.624 |
| 5270 | 3.624 |
| 5271 | 3.624 |
| 5272 | 3.62 |
| 5273 | 3.62 |
| 5274 | 3.62 |
| 5275 | 3.62 |
| 5276 | 3.62 |
| 5277 | 3.62 |
| 5278 | 3.62 |
| 5279 | 3.62 |
| 5280 | 3.62 |
| 5281 | 3.62 |
| 5282 | 3.62 |
| 5283 | 3.62 |
| 5284 | 3.62 |
| 5285 | 3.62 |
| 5286 | 3.598 |
| 5287 | 3.598 |
| 5288 | 3.598 |
| 5289 | 3.598 |
| 5290 | 3.598 |
| 5291 | 3.598 |
| 5292 | 3.598 |
| 5293 | 3.598 |
| 5294 | 3.598 |
| 5295 | 3.598 |
| 5296 | 3.598 |
| 5297 | 3.598 |
| 5298 | 3.598 |
| 5299 | 3.56 |
| 5300 | 3.56 |
| 5301 | 3.56 |
| 5302 | 3.56 |
| 5303 | 3.56 |
| 5304 | 3.56 |
| 5305 | 3.56 |
| 5306 | 3.56 |
| 5307 | 3.56 |
| 5308 | 3.56 |
| 5309 | 3.56 |
| 5310 | 3.56 |
| 5311 | 3.56 |
| 5312 | 3.56 |
| 5313 | 3.531 |
| 5314 | 3.531 |
| 5315 | 3.531 |
| 5316 | 3.531 |
| 5317 | 3.531 |
| 5318 | 3.531 |
| 5319 | 3.531 |
| 5320 | 3.531 |
| 5321 | 3.531 |
| 5322 | 3.531 |
| 5323 | 3.531 |
| 5324 | 3.531 |
| 5325 | 3.531 |
| 5326 | 3.531 |
| 5327 | 3.516 |
| 5328 | 3.516 |
| 5329 | 3.516 |
| 5330 | 3.516 |
| 5331 | 3.516 |
| 5332 | 3.516 |
| 5333 | 3.516 |
| 5334 | 3.516 |
| 5335 | 3.516 |
| 5336 | 3.516 |
| 5337 | 3.516 |
| 5338 | 3.516 |
| 5339 | 3.516 |
| 5340 | 3.516 |
| 5341 | 3.521 |
| 5342 | 3.521 |
| 5343 | 3.521 |
| 5344 | 3.521 |
| 5345 | 3.521 |
| 5346 | 3.521 |
| 5347 | 3.521 |
| 5348 | 3.521 |
| 5349 | 3.521 |
| 5350 | 3.521 |
| 5351 | 3.521 |
| 5352 | 3.521 |
| 5353 | 3.517 |
| 5354 | 3.517 |
| 5355 | 3.517 |
| 5356 | 3.517 |
| 5357 | 3.517 |
| 5358 | 3.517 |
| 5359 | 3.517 |
| 5360 | 3.517 |
| 5361 | 3.517 |
| 5362 | 3.517 |
| 5363 | 3.517 |
| 5364 | 3.517 |
| 5365 | 3.517 |
| 5366 | 3.517 |
| 5367 | 3.529 |
| 5368 | 3.529 |
| 5369 | 3.529 |
| 5370 | 3.529 |
| 5371 | 3.529 |
| 5372 | 3.529 |
| 5373 | 3.529 |
| 5374 | 3.529 |
| 5375 | 3.529 |
| 5376 | 3.529 |
| 5377 | 3.529 |
| 5378 | 3.529 |
| 5379 | 3.5 |
| 5380 | 3.5 |
| 5381 | 3.5 |
| 5382 | 3.5 |
| 5383 | 3.5 |
| 5384 | 3.5 |
| 5385 | 3.5 |
| 5386 | 3.5 |
| 5387 | 3.5 |
| 5388 | 3.5 |
| 5389 | 3.5 |
| 5390 | 3.5 |
| 5391 | 3.5 |
| 5392 | 3.5 |
| 5393 | 3.5 |
| 5394 | 3.5 |
| 5395 | 3.437 |
| 5396 | 3.437 |
| 5397 | 3.437 |
| 5398 | 3.437 |
| 5399 | 3.437 |
| 5400 | 3.437 |
| 5401 | 3.437 |
| 5402 | 3.437 |
| 5403 | 3.437 |
| 5404 | 3.437 |
| 5405 | 3.437 |
| 5406 | 3.437 |
| 5407 | 3.437 |
| 5408 | 3.437 |
| 5409 | 3.417 |
| 5410 | 3.417 |
| 5411 | 3.417 |
| 5412 | 3.417 |
| 5413 | 3.417 |
| 5414 | 3.417 |
| 5415 | 3.417 |
| 5416 | 3.417 |
| 5417 | 3.417 |
| 5418 | 3.417 |
| 5419 | 3.417 |
| 5420 | 3.417 |
| 5421 | 3.417 |
| 5422 | 3.417 |
| 5423 | 3.434 |
| 5424 | 3.434 |
| 5425 | 3.434 |
| 5426 | 3.434 |
| 5427 | 3.434 |
| 5428 | 3.434 |
| 5429 | 3.434 |
| 5430 | 3.434 |
| 5431 | 3.434 |
| 5432 | 3.434 |
| 5433 | 3.434 |
| 5434 | 3.434 |
| 5435 | 3.434 |
| 5436 | 3.434 |
| 5437 | 3.434 |
| 5438 | 3.427 |
| 5439 | 3.427 |
| 5440 | 3.427 |
| 5441 | 3.427 |
| 5442 | 3.427 |
| 5443 | 3.427 |
| 5444 | 3.427 |
| 5445 | 3.427 |
| 5446 | 3.427 |
| 5447 | 3.427 |
| 5448 | 3.427 |
| 5449 | 3.427 |
| 5450 | 3.391 |
| 5451 | 3.391 |
| 5452 | 3.391 |
| 5453 | 3.391 |
| 5454 | 3.391 |
| 5455 | 3.391 |
| 5456 | 3.391 |
| 5457 | 3.391 |
| 5458 | 3.391 |
| 5459 | 3.391 |
| 5460 | 3.391 |
| 5461 | 3.391 |
| 5462 | 3.377 |
| 5463 | 3.377 |
| 5464 | 3.377 |
| 5465 | 3.377 |
| 5466 | 3.377 |
| 5467 | 3.377 |
| 5468 | 3.377 |
| 5469 | 3.377 |
| 5470 | 3.377 |
| 5471 | 3.377 |
| 5472 | 3.377 |
| 5473 | 3.377 |
| 5474 | 3.377 |
| 5475 | 3.377 |
| 5476 | 3.394 |
| 5477 | 3.394 |
| 5478 | 3.394 |
| 5479 | 3.394 |
| 5480 | 3.394 |
| 5481 | 3.394 |
| 5482 | 3.394 |
| 5483 | 3.394 |
| 5484 | 3.394 |
| 5485 | 3.394 |
| 5486 | 3.394 |
| 5487 | 3.394 |
| 5488 | 3.394 |
| 5489 | 3.394 |
| 5490 | 3.394 |
| 5491 | 3.416 |
| 5492 | 3.416 |
| 5493 | 3.416 |
| 5494 | 3.416 |
| 5495 | 3.416 |
| 5496 | 3.416 |
| 5497 | 3.416 |
| 5498 | 3.416 |
| 5499 | 3.416 |
| 5500 | 3.416 |
| 5501 | 3.416 |
| 5502 | 3.416 |
| 5503 | 3.409 |
| 5504 | 3.409 |
| 5505 | 3.409 |
| 5506 | 3.409 |
| 5507 | 3.409 |
| 5508 | 3.409 |
| 5509 | 3.409 |
| 5510 | 3.409 |
| 5511 | 3.409 |
| 5512 | 3.409 |
| 5513 | 3.409 |
| 5514 | 3.409 |
| 5515 | 3.409 |
| 5516 | 3.394 |
| 5517 | 3.394 |
| 5518 | 3.394 |
| 5519 | 3.394 |
| 5520 | 3.394 |
| 5521 | 3.394 |
| 5522 | 3.394 |
| 5523 | 3.394 |
| 5524 | 3.394 |
| 5525 | 3.394 |
| 5526 | 3.394 |
| 5527 | 3.394 |
| 5528 | 3.394 |
| 5529 | 3.394 |
| 5530 | 3.366 |
| 5531 | 3.366 |
| 5532 | 3.366 |
| 5533 | 3.366 |
| 5534 | 3.366 |
| 5535 | 3.366 |
| 5536 | 3.366 |
| 5537 | 3.366 |
| 5538 | 3.366 |
| 5539 | 3.366 |
| 5540 | 3.366 |
| 5541 | 3.366 |
| 5542 | 3.366 |
| 5543 | 3.366 |
| 5544 | 3.366 |
| 5545 | 3.361 |
| 5546 | 3.361 |
| 5547 | 3.361 |
| 5548 | 3.361 |
| 5549 | 3.361 |
| 5550 | 3.361 |
| 5551 | 3.361 |
| 5552 | 3.361 |
| 5553 | 3.361 |
| 5554 | 3.361 |
| 5555 | 3.361 |
| 5556 | 3.361 |
| 5557 | 3.361 |
| 5558 | 3.361 |
| 5559 | 3.408 |
| 5560 | 3.408 |
| 5561 | 3.408 |
| 5562 | 3.408 |
| 5563 | 3.408 |
| 5564 | 3.408 |
| 5565 | 3.408 |
| 5566 | 3.408 |
| 5567 | 3.408 |
| 5568 | 3.408 |
| 5569 | 3.408 |
| 5570 | 3.408 |
| 5571 | 3.408 |
| 5572 | 3.463 |
| 5573 | 3.463 |
| 5574 | 3.463 |
| 5575 | 3.463 |
| 5576 | 3.463 |
| 5577 | 3.463 |
| 5578 | 3.463 |
| 5579 | 3.463 |
| 5580 | 3.463 |
| 5581 | 3.463 |
| 5582 | 3.463 |
| 5583 | 3.463 |
| 5584 | 3.463 |
| 5585 | 3.48 |
| 5586 | 3.48 |
| 5587 | 3.48 |
| 5588 | 3.48 |
| 5589 | 3.48 |
| 5590 | 3.48 |
| 5591 | 3.48 |
| 5592 | 3.48 |
| 5593 | 3.48 |
| 5594 | 3.48 |
| 5595 | 3.48 |
| 5596 | 3.48 |
| 5597 | 3.48 |
| 5598 | 3.48 |
| 5599 | 3.492 |
| 5600 | 3.492 |
| 5601 | 3.492 |
| 5602 | 3.492 |
| 5603 | 3.492 |
| 5604 | 3.492 |
| 5605 | 3.492 |
| 5606 | 3.492 |
| 5607 | 3.492 |
| 5608 | 3.492 |
| 5609 | 3.492 |
| 5610 | 3.492 |
| 5611 | 3.492 |
| 5612 | 3.472 |
| 5613 | 3.472 |
| 5614 | 3.472 |
| 5615 | 3.472 |
| 5616 | 3.472 |
| 5617 | 3.472 |
| 5618 | 3.472 |
| 5619 | 3.472 |
| 5620 | 3.472 |
| 5621 | 3.472 |
| 5622 | 3.472 |
| 5623 | 3.472 |
| 5624 | 3.472 |
| 5625 | 3.472 |
| 5626 | 3.477 |
| 5627 | 3.477 |
| 5628 | 3.477 |
| 5629 | 3.477 |
| 5630 | 3.477 |
| 5631 | 3.477 |
| 5632 | 3.477 |
| 5633 | 3.477 |
| 5634 | 3.477 |
| 5635 | 3.477 |
| 5636 | 3.477 |
| 5637 | 3.477 |
| 5638 | 3.477 |
| 5639 | 3.386 |
| 5640 | 3.386 |
| 5641 | 3.386 |
| 5642 | 3.386 |
| 5643 | 3.386 |
| 5644 | 3.386 |
| 5645 | 3.386 |
| 5646 | 3.386 |
| 5647 | 3.386 |
| 5648 | 3.386 |
| 5649 | 3.386 |
| 5650 | 3.386 |
| 5651 | 3.386 |
| 5652 | 3.386 |
| 5653 | 3.386 |
| 5654 | 3.386 |
| 5655 | 3.386 |
| 5656 | 3.386 |
| 5657 | 3.386 |
| 5658 | 3.386 |
| 5659 | 3.386 |
| 5660 | 3.386 |
| 5661 | 3.386 |
| 5662 | 3.386 |
| 5663 | 3.386 |
| 5664 | 3.386 |
| 5665 | 3.386 |
| 5666 | 3.386 |
| 5667 | 3.386 |
| 5668 | 3.386 |
| 5669 | 3.386 |
| 5670 | 3.386 |
| 5671 | 3.386 |
| 5672 | 3.386 |
| 5673 | 3.386 |
| 5674 | 3.386 |
| 5675 | 3.386 |
| 5676 | 3.386 |
| 5677 | 3.386 |
| 5678 | 3.386 |
| 5679 | 3.386 |
| 5680 | 3.386 |